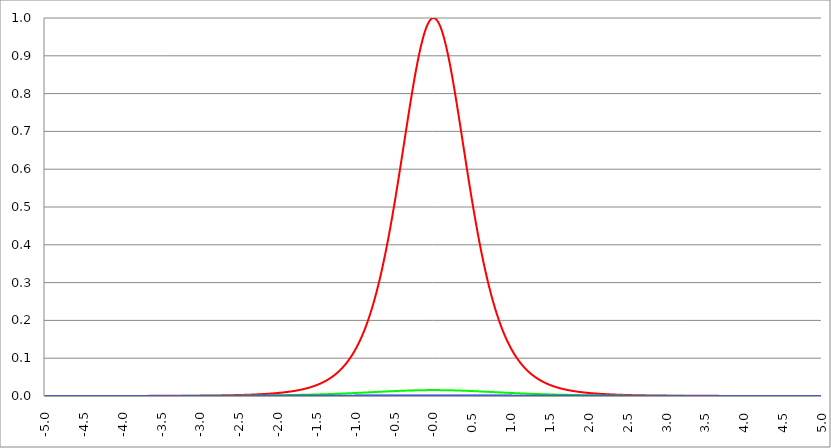
| Category | Series 1 | Series 0 | Series 2 |
|---|---|---|---|
| -5.0 | 0 | 0 | 0 |
| -4.995 | 0 | 0 | 0 |
| -4.99 | 0 | 0 | 0 |
| -4.985 | 0 | 0 | 0 |
| -4.98 | 0 | 0 | 0 |
| -4.975 | 0 | 0 | 0 |
| -4.97 | 0 | 0 | 0 |
| -4.965000000000001 | 0 | 0 | 0 |
| -4.960000000000001 | 0 | 0 | 0 |
| -4.955000000000001 | 0 | 0 | 0 |
| -4.950000000000001 | 0 | 0 | 0 |
| -4.945000000000001 | 0 | 0 | 0 |
| -4.940000000000001 | 0 | 0 | 0 |
| -4.935000000000001 | 0 | 0 | 0 |
| -4.930000000000001 | 0 | 0 | 0 |
| -4.925000000000002 | 0 | 0 | 0 |
| -4.920000000000002 | 0 | 0 | 0 |
| -4.915000000000002 | 0 | 0 | 0 |
| -4.910000000000002 | 0 | 0 | 0 |
| -4.905000000000002 | 0 | 0 | 0 |
| -4.900000000000002 | 0 | 0 | 0 |
| -4.895000000000002 | 0 | 0 | 0 |
| -4.890000000000002 | 0 | 0 | 0 |
| -4.885000000000002 | 0 | 0 | 0 |
| -4.880000000000002 | 0 | 0 | 0 |
| -4.875000000000003 | 0 | 0 | 0 |
| -4.870000000000003 | 0 | 0 | 0 |
| -4.865000000000003 | 0 | 0 | 0 |
| -4.860000000000003 | 0 | 0 | 0 |
| -4.855000000000003 | 0 | 0 | 0 |
| -4.850000000000003 | 0 | 0 | 0 |
| -4.845000000000003 | 0 | 0 | 0 |
| -4.840000000000003 | 0 | 0 | 0 |
| -4.835000000000003 | 0 | 0 | 0 |
| -4.830000000000004 | 0 | 0 | 0 |
| -4.825000000000004 | 0 | 0 | 0 |
| -4.820000000000004 | 0 | 0 | 0 |
| -4.815000000000004 | 0 | 0 | 0 |
| -4.810000000000004 | 0 | 0 | 0 |
| -4.805000000000004 | 0 | 0 | 0 |
| -4.800000000000004 | 0 | 0 | 0 |
| -4.795000000000004 | 0 | 0 | 0 |
| -4.790000000000004 | 0 | 0 | 0 |
| -4.785000000000004 | 0 | 0 | 0 |
| -4.780000000000004 | 0 | 0 | 0 |
| -4.775000000000004 | 0 | 0 | 0 |
| -4.770000000000004 | 0 | 0 | 0 |
| -4.765000000000005 | 0 | 0 | 0 |
| -4.760000000000005 | 0 | 0 | 0 |
| -4.755000000000005 | 0 | 0 | 0 |
| -4.750000000000005 | 0 | 0 | 0 |
| -4.745000000000005 | 0 | 0 | 0 |
| -4.740000000000005 | 0 | 0 | 0 |
| -4.735000000000005 | 0 | 0 | 0 |
| -4.730000000000005 | 0 | 0 | 0 |
| -4.725000000000006 | 0 | 0 | 0 |
| -4.720000000000006 | 0 | 0 | 0 |
| -4.715000000000006 | 0 | 0 | 0 |
| -4.710000000000006 | 0 | 0 | 0 |
| -4.705000000000006 | 0 | 0 | 0 |
| -4.700000000000006 | 0 | 0 | 0 |
| -4.695000000000006 | 0 | 0 | 0 |
| -4.690000000000006 | 0 | 0 | 0 |
| -4.685000000000007 | 0 | 0 | 0 |
| -4.680000000000007 | 0 | 0 | 0 |
| -4.675000000000007 | 0 | 0 | 0 |
| -4.670000000000007 | 0 | 0 | 0 |
| -4.665000000000007 | 0 | 0 | 0 |
| -4.660000000000007 | 0 | 0 | 0 |
| -4.655000000000007 | 0 | 0 | 0 |
| -4.650000000000007 | 0 | 0 | 0 |
| -4.645000000000007 | 0 | 0 | 0 |
| -4.640000000000008 | 0 | 0 | 0 |
| -4.635000000000008 | 0 | 0 | 0 |
| -4.630000000000008 | 0 | 0 | 0 |
| -4.625000000000008 | 0 | 0 | 0 |
| -4.620000000000008 | 0 | 0 | 0 |
| -4.615000000000008 | 0 | 0 | 0 |
| -4.610000000000008 | 0 | 0 | 0 |
| -4.605000000000008 | 0 | 0 | 0 |
| -4.600000000000008 | 0 | 0 | 0 |
| -4.595000000000009 | 0 | 0 | 0 |
| -4.590000000000009 | 0 | 0 | 0 |
| -4.585000000000009 | 0 | 0 | 0 |
| -4.580000000000009 | 0 | 0 | 0 |
| -4.57500000000001 | 0 | 0 | 0 |
| -4.57000000000001 | 0 | 0 | 0 |
| -4.565000000000009 | 0 | 0 | 0 |
| -4.560000000000009 | 0 | 0 | 0 |
| -4.555000000000009 | 0 | 0 | 0 |
| -4.55000000000001 | 0 | 0 | 0 |
| -4.54500000000001 | 0 | 0 | 0 |
| -4.54000000000001 | 0 | 0 | 0 |
| -4.53500000000001 | 0 | 0 | 0 |
| -4.53000000000001 | 0 | 0 | 0 |
| -4.52500000000001 | 0 | 0 | 0 |
| -4.52000000000001 | 0 | 0 | 0 |
| -4.51500000000001 | 0 | 0 | 0 |
| -4.51000000000001 | 0 | 0 | 0 |
| -4.505000000000011 | 0 | 0 | 0 |
| -4.500000000000011 | 0 | 0 | 0 |
| -4.495000000000011 | 0 | 0 | 0 |
| -4.490000000000011 | 0 | 0 | 0 |
| -4.485000000000011 | 0 | 0 | 0 |
| -4.480000000000011 | 0 | 0 | 0 |
| -4.475000000000011 | 0 | 0 | 0 |
| -4.470000000000011 | 0 | 0 | 0 |
| -4.465000000000011 | 0 | 0 | 0 |
| -4.460000000000011 | 0 | 0 | 0 |
| -4.455000000000012 | 0 | 0 | 0 |
| -4.450000000000012 | 0 | 0 | 0 |
| -4.445000000000012 | 0 | 0 | 0 |
| -4.440000000000012 | 0 | 0 | 0 |
| -4.435000000000012 | 0 | 0 | 0 |
| -4.430000000000012 | 0 | 0 | 0 |
| -4.425000000000012 | 0 | 0 | 0 |
| -4.420000000000012 | 0 | 0 | 0 |
| -4.415000000000012 | 0 | 0 | 0 |
| -4.410000000000013 | 0 | 0 | 0 |
| -4.405000000000013 | 0 | 0 | 0 |
| -4.400000000000013 | 0 | 0 | 0 |
| -4.395000000000013 | 0 | 0 | 0 |
| -4.390000000000013 | 0 | 0 | 0 |
| -4.385000000000013 | 0 | 0 | 0 |
| -4.380000000000013 | 0 | 0 | 0 |
| -4.375000000000013 | 0 | 0 | 0 |
| -4.370000000000013 | 0 | 0 | 0 |
| -4.365000000000013 | 0 | 0 | 0 |
| -4.360000000000014 | 0 | 0 | 0 |
| -4.355000000000014 | 0 | 0 | 0 |
| -4.350000000000014 | 0 | 0 | 0 |
| -4.345000000000014 | 0 | 0 | 0 |
| -4.340000000000014 | 0 | 0 | 0 |
| -4.335000000000014 | 0 | 0 | 0 |
| -4.330000000000014 | 0 | 0 | 0 |
| -4.325000000000014 | 0 | 0 | 0 |
| -4.320000000000014 | 0 | 0 | 0 |
| -4.315000000000015 | 0 | 0 | 0 |
| -4.310000000000015 | 0 | 0 | 0 |
| -4.305000000000015 | 0 | 0 | 0 |
| -4.300000000000015 | 0 | 0 | 0 |
| -4.295000000000015 | 0 | 0 | 0 |
| -4.290000000000015 | 0 | 0 | 0 |
| -4.285000000000015 | 0 | 0 | 0 |
| -4.280000000000015 | 0 | 0 | 0 |
| -4.275000000000015 | 0 | 0 | 0 |
| -4.270000000000015 | 0 | 0 | 0 |
| -4.265000000000016 | 0 | 0 | 0 |
| -4.260000000000016 | 0 | 0 | 0 |
| -4.255000000000016 | 0 | 0 | 0 |
| -4.250000000000016 | 0 | 0 | 0 |
| -4.245000000000016 | 0 | 0 | 0 |
| -4.240000000000016 | 0 | 0 | 0 |
| -4.235000000000016 | 0 | 0 | 0 |
| -4.230000000000016 | 0 | 0 | 0 |
| -4.225000000000017 | 0 | 0 | 0 |
| -4.220000000000017 | 0 | 0 | 0 |
| -4.215000000000017 | 0 | 0 | 0 |
| -4.210000000000017 | 0 | 0 | 0 |
| -4.205000000000017 | 0 | 0 | 0 |
| -4.200000000000017 | 0 | 0 | 0 |
| -4.195000000000017 | 0 | 0 | 0 |
| -4.190000000000017 | 0 | 0 | 0 |
| -4.185000000000017 | 0 | 0 | 0 |
| -4.180000000000017 | 0 | 0 | 0 |
| -4.175000000000018 | 0 | 0 | 0 |
| -4.170000000000018 | 0 | 0 | 0 |
| -4.165000000000018 | 0 | 0 | 0 |
| -4.160000000000018 | 0 | 0 | 0 |
| -4.155000000000018 | 0 | 0 | 0 |
| -4.150000000000018 | 0 | 0 | 0 |
| -4.145000000000018 | 0 | 0 | 0 |
| -4.140000000000018 | 0 | 0 | 0 |
| -4.135000000000018 | 0 | 0 | 0 |
| -4.130000000000019 | 0 | 0 | 0 |
| -4.125000000000019 | 0 | 0 | 0 |
| -4.120000000000019 | 0 | 0 | 0 |
| -4.115000000000019 | 0 | 0 | 0 |
| -4.110000000000019 | 0 | 0 | 0 |
| -4.105000000000019 | 0 | 0 | 0 |
| -4.100000000000019 | 0 | 0 | 0 |
| -4.095000000000019 | 0 | 0 | 0 |
| -4.090000000000019 | 0 | 0 | 0 |
| -4.085000000000019 | 0 | 0 | 0 |
| -4.08000000000002 | 0 | 0 | 0 |
| -4.07500000000002 | 0 | 0 | 0 |
| -4.07000000000002 | 0 | 0 | 0 |
| -4.06500000000002 | 0 | 0 | 0 |
| -4.06000000000002 | 0 | 0 | 0 |
| -4.05500000000002 | 0 | 0 | 0 |
| -4.05000000000002 | 0 | 0 | 0 |
| -4.04500000000002 | 0 | 0 | 0 |
| -4.04000000000002 | 0 | 0 | 0 |
| -4.03500000000002 | 0 | 0 | 0 |
| -4.03000000000002 | 0 | 0 | 0 |
| -4.025000000000021 | 0 | 0 | 0 |
| -4.020000000000021 | 0 | 0 | 0 |
| -4.015000000000021 | 0 | 0 | 0 |
| -4.010000000000021 | 0 | 0 | 0 |
| -4.005000000000021 | 0 | 0 | 0 |
| -4.000000000000021 | 0 | 0 | 0 |
| -3.995000000000021 | 0 | 0 | 0 |
| -3.990000000000021 | 0 | 0 | 0 |
| -3.985000000000022 | 0 | 0 | 0 |
| -3.980000000000022 | 0 | 0 | 0 |
| -3.975000000000022 | 0 | 0 | 0 |
| -3.970000000000022 | 0 | 0 | 0 |
| -3.965000000000022 | 0 | 0 | 0 |
| -3.960000000000022 | 0 | 0 | 0 |
| -3.955000000000022 | 0 | 0 | 0 |
| -3.950000000000022 | 0 | 0 | 0 |
| -3.945000000000022 | 0 | 0 | 0 |
| -3.940000000000023 | 0 | 0 | 0 |
| -3.935000000000023 | 0 | 0 | 0 |
| -3.930000000000023 | 0 | 0 | 0 |
| -3.925000000000023 | 0 | 0 | 0 |
| -3.920000000000023 | 0 | 0 | 0 |
| -3.915000000000023 | 0 | 0 | 0 |
| -3.910000000000023 | 0 | 0 | 0 |
| -3.905000000000023 | 0 | 0 | 0 |
| -3.900000000000023 | 0 | 0 | 0 |
| -3.895000000000023 | 0 | 0 | 0 |
| -3.890000000000024 | 0 | 0 | 0 |
| -3.885000000000024 | 0 | 0 | 0 |
| -3.880000000000024 | 0 | 0 | 0 |
| -3.875000000000024 | 0 | 0 | 0 |
| -3.870000000000024 | 0 | 0 | 0 |
| -3.865000000000024 | 0 | 0 | 0 |
| -3.860000000000024 | 0 | 0 | 0 |
| -3.855000000000024 | 0 | 0 | 0 |
| -3.850000000000024 | 0 | 0 | 0 |
| -3.845000000000025 | 0 | 0 | 0 |
| -3.840000000000025 | 0 | 0 | 0 |
| -3.835000000000025 | 0 | 0 | 0 |
| -3.830000000000025 | 0 | 0 | 0 |
| -3.825000000000025 | 0 | 0 | 0 |
| -3.820000000000025 | 0 | 0 | 0 |
| -3.815000000000025 | 0 | 0 | 0 |
| -3.810000000000025 | 0 | 0 | 0 |
| -3.805000000000025 | 0 | 0 | 0 |
| -3.800000000000026 | 0 | 0 | 0 |
| -3.795000000000026 | 0 | 0 | 0 |
| -3.790000000000026 | 0 | 0 | 0 |
| -3.785000000000026 | 0 | 0 | 0 |
| -3.780000000000026 | 0 | 0 | 0 |
| -3.775000000000026 | 0 | 0 | 0 |
| -3.770000000000026 | 0 | 0 | 0 |
| -3.765000000000026 | 0 | 0 | 0 |
| -3.760000000000026 | 0 | 0 | 0 |
| -3.755000000000026 | 0 | 0 | 0 |
| -3.750000000000027 | 0 | 0 | 0 |
| -3.745000000000027 | 0 | 0 | 0 |
| -3.740000000000027 | 0 | 0 | 0 |
| -3.735000000000027 | 0 | 0 | 0 |
| -3.730000000000027 | 0 | 0 | 0 |
| -3.725000000000027 | 0 | 0 | 0 |
| -3.720000000000027 | 0 | 0 | 0 |
| -3.715000000000027 | 0 | 0 | 0 |
| -3.710000000000027 | 0 | 0 | 0 |
| -3.705000000000028 | 0 | 0 | 0 |
| -3.700000000000028 | 0 | 0 | 0 |
| -3.695000000000028 | 0 | 0 | 0 |
| -3.690000000000028 | 0 | 0 | 0 |
| -3.685000000000028 | 0 | 0 | 0 |
| -3.680000000000028 | 0 | 0 | 0 |
| -3.675000000000028 | 0 | 0 | 0 |
| -3.670000000000028 | 0 | 0 | 0 |
| -3.665000000000028 | 0 | 0 | 0 |
| -3.660000000000028 | 0 | 0 | 0 |
| -3.655000000000029 | 0 | 0 | 0 |
| -3.650000000000029 | 0 | 0 | 0 |
| -3.645000000000029 | 0 | 0 | 0 |
| -3.640000000000029 | 0 | 0 | 0 |
| -3.635000000000029 | 0 | 0 | 0 |
| -3.630000000000029 | 0 | 0 | 0 |
| -3.625000000000029 | 0 | 0 | 0 |
| -3.620000000000029 | 0 | 0 | 0 |
| -3.615000000000029 | 0 | 0 | 0 |
| -3.61000000000003 | 0 | 0 | 0 |
| -3.60500000000003 | 0 | 0 | 0 |
| -3.60000000000003 | 0 | 0 | 0 |
| -3.59500000000003 | 0 | 0 | 0 |
| -3.59000000000003 | 0 | 0 | 0 |
| -3.58500000000003 | 0 | 0 | 0 |
| -3.58000000000003 | 0 | 0 | 0 |
| -3.57500000000003 | 0 | 0 | 0 |
| -3.57000000000003 | 0 | 0 | 0 |
| -3.565000000000031 | 0 | 0 | 0 |
| -3.560000000000031 | 0 | 0 | 0 |
| -3.555000000000031 | 0 | 0 | 0 |
| -3.550000000000031 | 0 | 0 | 0 |
| -3.545000000000031 | 0 | 0 | 0 |
| -3.540000000000031 | 0 | 0 | 0 |
| -3.535000000000031 | 0 | 0 | 0 |
| -3.530000000000031 | 0 | 0 | 0 |
| -3.525000000000031 | 0 | 0 | 0 |
| -3.520000000000032 | 0 | 0 | 0 |
| -3.515000000000032 | 0 | 0 | 0 |
| -3.510000000000032 | 0 | 0 | 0 |
| -3.505000000000032 | 0 | 0 | 0 |
| -3.500000000000032 | 0 | 0 | 0 |
| -3.495000000000032 | 0 | 0 | 0 |
| -3.490000000000032 | 0 | 0 | 0 |
| -3.485000000000032 | 0 | 0 | 0 |
| -3.480000000000032 | 0 | 0 | 0 |
| -3.475000000000032 | 0 | 0 | 0 |
| -3.470000000000033 | 0 | 0 | 0 |
| -3.465000000000033 | 0 | 0 | 0 |
| -3.460000000000033 | 0 | 0 | 0 |
| -3.455000000000033 | 0 | 0 | 0 |
| -3.450000000000033 | 0 | 0 | 0 |
| -3.445000000000033 | 0 | 0 | 0 |
| -3.440000000000033 | 0 | 0 | 0 |
| -3.435000000000033 | 0 | 0 | 0 |
| -3.430000000000033 | 0 | 0 | 0 |
| -3.425000000000034 | 0 | 0 | 0 |
| -3.420000000000034 | 0 | 0 | 0 |
| -3.415000000000034 | 0 | 0 | 0 |
| -3.410000000000034 | 0 | 0 | 0 |
| -3.405000000000034 | 0.001 | 0 | 0 |
| -3.400000000000034 | 0.001 | 0 | 0 |
| -3.395000000000034 | 0.001 | 0 | 0 |
| -3.390000000000034 | 0.001 | 0 | 0 |
| -3.385000000000034 | 0.001 | 0 | 0 |
| -3.380000000000034 | 0.001 | 0 | 0 |
| -3.375000000000035 | 0.001 | 0 | 0 |
| -3.370000000000035 | 0.001 | 0 | 0 |
| -3.365000000000035 | 0.001 | 0 | 0 |
| -3.360000000000035 | 0.001 | 0 | 0 |
| -3.355000000000035 | 0.001 | 0 | 0 |
| -3.350000000000035 | 0.001 | 0 | 0 |
| -3.345000000000035 | 0.001 | 0 | 0 |
| -3.340000000000035 | 0.001 | 0 | 0 |
| -3.335000000000035 | 0.001 | 0 | 0 |
| -3.330000000000036 | 0.001 | 0 | 0 |
| -3.325000000000036 | 0.001 | 0 | 0 |
| -3.320000000000036 | 0.001 | 0 | 0 |
| -3.315000000000036 | 0.001 | 0 | 0 |
| -3.310000000000036 | 0.001 | 0 | 0 |
| -3.305000000000036 | 0.001 | 0 | 0 |
| -3.300000000000036 | 0.001 | 0 | 0 |
| -3.295000000000036 | 0.001 | 0 | 0 |
| -3.290000000000036 | 0.001 | 0 | 0 |
| -3.285000000000036 | 0.001 | 0 | 0 |
| -3.280000000000036 | 0.001 | 0 | 0 |
| -3.275000000000037 | 0.001 | 0 | 0 |
| -3.270000000000037 | 0.001 | 0 | 0 |
| -3.265000000000037 | 0.001 | 0 | 0 |
| -3.260000000000037 | 0.001 | 0 | 0 |
| -3.255000000000037 | 0.001 | 0 | 0 |
| -3.250000000000037 | 0.001 | 0 | 0 |
| -3.245000000000037 | 0.001 | 0 | 0 |
| -3.240000000000037 | 0.001 | 0 | 0 |
| -3.235000000000038 | 0.001 | 0 | 0 |
| -3.230000000000038 | 0.001 | 0 | 0 |
| -3.225000000000038 | 0.001 | 0 | 0 |
| -3.220000000000038 | 0.001 | 0 | 0 |
| -3.215000000000038 | 0.001 | 0 | 0 |
| -3.210000000000038 | 0.001 | 0 | 0 |
| -3.205000000000038 | 0.001 | 0 | 0 |
| -3.200000000000038 | 0.001 | 0 | 0 |
| -3.195000000000038 | 0.001 | 0 | 0 |
| -3.190000000000039 | 0.001 | 0 | 0 |
| -3.185000000000039 | 0.001 | 0 | 0 |
| -3.180000000000039 | 0.001 | 0 | 0 |
| -3.175000000000039 | 0.001 | 0 | 0 |
| -3.170000000000039 | 0.001 | 0 | 0 |
| -3.16500000000004 | 0.001 | 0 | 0 |
| -3.16000000000004 | 0.001 | 0 | 0 |
| -3.155000000000039 | 0.001 | 0 | 0 |
| -3.150000000000039 | 0.001 | 0 | 0 |
| -3.14500000000004 | 0.001 | 0 | 0 |
| -3.14000000000004 | 0.001 | 0 | 0 |
| -3.13500000000004 | 0.001 | 0 | 0 |
| -3.13000000000004 | 0.001 | 0 | 0 |
| -3.12500000000004 | 0.001 | 0 | 0 |
| -3.12000000000004 | 0.001 | 0 | 0 |
| -3.11500000000004 | 0.001 | 0 | 0 |
| -3.11000000000004 | 0.001 | 0 | 0 |
| -3.10500000000004 | 0.001 | 0 | 0 |
| -3.10000000000004 | 0.001 | 0 | 0 |
| -3.095000000000041 | 0.001 | 0 | 0 |
| -3.090000000000041 | 0.001 | 0 | 0 |
| -3.085000000000041 | 0.001 | 0 | 0 |
| -3.080000000000041 | 0.001 | 0 | 0 |
| -3.075000000000041 | 0.001 | 0 | 0 |
| -3.070000000000041 | 0.001 | 0 | 0 |
| -3.065000000000041 | 0.001 | 0 | 0 |
| -3.060000000000041 | 0.001 | 0 | 0 |
| -3.055000000000041 | 0.001 | 0 | 0 |
| -3.050000000000042 | 0.001 | 0 | 0 |
| -3.045000000000042 | 0.001 | 0 | 0 |
| -3.040000000000042 | 0.001 | 0 | 0 |
| -3.035000000000042 | 0.001 | 0 | 0 |
| -3.030000000000042 | 0.001 | 0 | 0 |
| -3.025000000000042 | 0.001 | 0 | 0 |
| -3.020000000000042 | 0.001 | 0 | 0 |
| -3.015000000000042 | 0.001 | 0 | 0 |
| -3.010000000000042 | 0.001 | 0 | 0 |
| -3.005000000000043 | 0.001 | 0 | 0 |
| -3.000000000000043 | 0.001 | 0 | 0 |
| -2.995000000000043 | 0.001 | 0 | 0 |
| -2.990000000000043 | 0.001 | 0 | 0 |
| -2.985000000000043 | 0.001 | 0 | 0 |
| -2.980000000000043 | 0.001 | 0 | 0 |
| -2.975000000000043 | 0.001 | 0 | 0 |
| -2.970000000000043 | 0.001 | 0 | 0 |
| -2.965000000000043 | 0.001 | 0 | 0 |
| -2.960000000000043 | 0.001 | 0 | 0 |
| -2.955000000000044 | 0.001 | 0 | 0 |
| -2.950000000000044 | 0.001 | 0 | 0 |
| -2.945000000000044 | 0.001 | 0 | 0 |
| -2.940000000000044 | 0.001 | 0 | 0 |
| -2.935000000000044 | 0.001 | 0 | 0 |
| -2.930000000000044 | 0.001 | 0.001 | 0 |
| -2.925000000000044 | 0.001 | 0.001 | 0 |
| -2.920000000000044 | 0.001 | 0.001 | 0 |
| -2.915000000000044 | 0.001 | 0.001 | 0 |
| -2.910000000000045 | 0.001 | 0.001 | 0 |
| -2.905000000000045 | 0.001 | 0.001 | 0 |
| -2.900000000000045 | 0.001 | 0.001 | 0 |
| -2.895000000000045 | 0.001 | 0.001 | 0 |
| -2.890000000000045 | 0.001 | 0.001 | 0 |
| -2.885000000000045 | 0.001 | 0.001 | 0 |
| -2.880000000000045 | 0.001 | 0.001 | 0 |
| -2.875000000000045 | 0.001 | 0.001 | 0 |
| -2.870000000000045 | 0.001 | 0.001 | 0 |
| -2.865000000000045 | 0.001 | 0.001 | 0 |
| -2.860000000000046 | 0.001 | 0.001 | 0 |
| -2.855000000000046 | 0.001 | 0.001 | 0 |
| -2.850000000000046 | 0.001 | 0.001 | 0 |
| -2.845000000000046 | 0.001 | 0.001 | 0 |
| -2.840000000000046 | 0.001 | 0.001 | 0 |
| -2.835000000000046 | 0.001 | 0.001 | 0 |
| -2.830000000000046 | 0.001 | 0.001 | 0 |
| -2.825000000000046 | 0.001 | 0.001 | 0 |
| -2.820000000000046 | 0.001 | 0.001 | 0 |
| -2.815000000000047 | 0.001 | 0.001 | 0 |
| -2.810000000000047 | 0.001 | 0.001 | 0 |
| -2.805000000000047 | 0.001 | 0.001 | 0 |
| -2.800000000000047 | 0.001 | 0.001 | 0 |
| -2.795000000000047 | 0.001 | 0.001 | 0 |
| -2.790000000000047 | 0.001 | 0.001 | 0 |
| -2.785000000000047 | 0.001 | 0.001 | 0 |
| -2.780000000000047 | 0.002 | 0.001 | 0 |
| -2.775000000000047 | 0.002 | 0.001 | 0 |
| -2.770000000000047 | 0.002 | 0.001 | 0 |
| -2.765000000000048 | 0.002 | 0.001 | 0 |
| -2.760000000000048 | 0.002 | 0.001 | 0 |
| -2.755000000000048 | 0.002 | 0.001 | 0 |
| -2.750000000000048 | 0.002 | 0.001 | 0 |
| -2.745000000000048 | 0.002 | 0.001 | 0 |
| -2.740000000000048 | 0.002 | 0.001 | 0 |
| -2.735000000000048 | 0.002 | 0.001 | 0 |
| -2.730000000000048 | 0.002 | 0.001 | 0 |
| -2.725000000000048 | 0.002 | 0.001 | 0 |
| -2.720000000000049 | 0.002 | 0.001 | 0 |
| -2.715000000000049 | 0.002 | 0.001 | 0 |
| -2.710000000000049 | 0.002 | 0.001 | 0 |
| -2.705000000000049 | 0.002 | 0.001 | 0 |
| -2.700000000000049 | 0.002 | 0.001 | 0 |
| -2.695000000000049 | 0.002 | 0.001 | 0 |
| -2.690000000000049 | 0.002 | 0.001 | 0 |
| -2.685000000000049 | 0.002 | 0.001 | 0 |
| -2.680000000000049 | 0.002 | 0.001 | 0 |
| -2.675000000000049 | 0.002 | 0.001 | 0 |
| -2.67000000000005 | 0.002 | 0.001 | 0 |
| -2.66500000000005 | 0.002 | 0.001 | 0 |
| -2.66000000000005 | 0.002 | 0.001 | 0 |
| -2.65500000000005 | 0.002 | 0.001 | 0 |
| -2.65000000000005 | 0.002 | 0.001 | 0 |
| -2.64500000000005 | 0.002 | 0.001 | 0 |
| -2.64000000000005 | 0.002 | 0.001 | 0 |
| -2.63500000000005 | 0.002 | 0.001 | 0 |
| -2.63000000000005 | 0.002 | 0.001 | 0 |
| -2.625000000000051 | 0.002 | 0.001 | 0 |
| -2.620000000000051 | 0.002 | 0.001 | 0 |
| -2.615000000000051 | 0.002 | 0.001 | 0 |
| -2.610000000000051 | 0.002 | 0.001 | 0 |
| -2.605000000000051 | 0.002 | 0.001 | 0 |
| -2.600000000000051 | 0.002 | 0.001 | 0 |
| -2.595000000000051 | 0.002 | 0.001 | 0 |
| -2.590000000000051 | 0.002 | 0.001 | 0 |
| -2.585000000000051 | 0.002 | 0.001 | 0 |
| -2.580000000000052 | 0.002 | 0.001 | 0 |
| -2.575000000000052 | 0.002 | 0.001 | 0 |
| -2.570000000000052 | 0.002 | 0.001 | 0 |
| -2.565000000000052 | 0.002 | 0.001 | 0 |
| -2.560000000000052 | 0.002 | 0.001 | 0 |
| -2.555000000000052 | 0.002 | 0.001 | 0 |
| -2.550000000000052 | 0.002 | 0.001 | 0 |
| -2.545000000000052 | 0.002 | 0.001 | 0 |
| -2.540000000000052 | 0.002 | 0.001 | 0 |
| -2.535000000000053 | 0.002 | 0.001 | 0 |
| -2.530000000000053 | 0.002 | 0.001 | 0 |
| -2.525000000000053 | 0.002 | 0.001 | 0 |
| -2.520000000000053 | 0.003 | 0.001 | 0 |
| -2.515000000000053 | 0.003 | 0.001 | 0 |
| -2.510000000000053 | 0.003 | 0.001 | 0 |
| -2.505000000000053 | 0.003 | 0.001 | 0 |
| -2.500000000000053 | 0.003 | 0.001 | 0 |
| -2.495000000000053 | 0.003 | 0.001 | 0 |
| -2.490000000000053 | 0.003 | 0.001 | 0 |
| -2.485000000000054 | 0.003 | 0.001 | 0 |
| -2.480000000000054 | 0.003 | 0.001 | 0 |
| -2.475000000000054 | 0.003 | 0.001 | 0 |
| -2.470000000000054 | 0.003 | 0.001 | 0 |
| -2.465000000000054 | 0.003 | 0.001 | 0 |
| -2.460000000000054 | 0.003 | 0.001 | 0 |
| -2.455000000000054 | 0.003 | 0.001 | 0 |
| -2.450000000000054 | 0.003 | 0.001 | 0 |
| -2.445000000000054 | 0.003 | 0.001 | 0 |
| -2.440000000000055 | 0.003 | 0.001 | 0 |
| -2.435000000000055 | 0.003 | 0.001 | 0 |
| -2.430000000000055 | 0.003 | 0.001 | 0 |
| -2.425000000000055 | 0.003 | 0.001 | 0 |
| -2.420000000000055 | 0.003 | 0.001 | 0 |
| -2.415000000000055 | 0.003 | 0.001 | 0 |
| -2.410000000000055 | 0.003 | 0.001 | 0 |
| -2.405000000000055 | 0.003 | 0.001 | 0 |
| -2.400000000000055 | 0.003 | 0.001 | 0 |
| -2.395000000000055 | 0.003 | 0.001 | 0 |
| -2.390000000000056 | 0.003 | 0.001 | 0 |
| -2.385000000000056 | 0.003 | 0.001 | 0 |
| -2.380000000000056 | 0.003 | 0.001 | 0 |
| -2.375000000000056 | 0.003 | 0.001 | 0 |
| -2.370000000000056 | 0.003 | 0.001 | 0 |
| -2.365000000000056 | 0.003 | 0.001 | 0 |
| -2.360000000000056 | 0.004 | 0.001 | 0 |
| -2.355000000000056 | 0.004 | 0.001 | 0 |
| -2.350000000000056 | 0.004 | 0.001 | 0 |
| -2.345000000000057 | 0.004 | 0.001 | 0 |
| -2.340000000000057 | 0.004 | 0.001 | 0 |
| -2.335000000000057 | 0.004 | 0.001 | 0 |
| -2.330000000000057 | 0.004 | 0.001 | 0 |
| -2.325000000000057 | 0.004 | 0.001 | 0 |
| -2.320000000000057 | 0.004 | 0.001 | 0 |
| -2.315000000000057 | 0.004 | 0.001 | 0 |
| -2.310000000000057 | 0.004 | 0.001 | 0 |
| -2.305000000000057 | 0.004 | 0.001 | 0 |
| -2.300000000000058 | 0.004 | 0.001 | 0 |
| -2.295000000000058 | 0.004 | 0.001 | 0 |
| -2.290000000000058 | 0.004 | 0.001 | 0 |
| -2.285000000000058 | 0.004 | 0.001 | 0 |
| -2.280000000000058 | 0.004 | 0.001 | 0 |
| -2.275000000000058 | 0.004 | 0.001 | 0 |
| -2.270000000000058 | 0.004 | 0.001 | 0 |
| -2.265000000000058 | 0.004 | 0.001 | 0 |
| -2.260000000000058 | 0.004 | 0.001 | 0 |
| -2.255000000000058 | 0.004 | 0.001 | 0 |
| -2.250000000000059 | 0.004 | 0.001 | 0 |
| -2.245000000000059 | 0.005 | 0.001 | 0 |
| -2.240000000000059 | 0.005 | 0.001 | 0 |
| -2.235000000000059 | 0.005 | 0.001 | 0 |
| -2.23000000000006 | 0.005 | 0.001 | 0 |
| -2.22500000000006 | 0.005 | 0.001 | 0 |
| -2.22000000000006 | 0.005 | 0.001 | 0 |
| -2.215000000000059 | 0.005 | 0.001 | 0 |
| -2.210000000000059 | 0.005 | 0.001 | 0 |
| -2.20500000000006 | 0.005 | 0.001 | 0 |
| -2.20000000000006 | 0.005 | 0.001 | 0 |
| -2.19500000000006 | 0.005 | 0.001 | 0 |
| -2.19000000000006 | 0.005 | 0.001 | 0 |
| -2.18500000000006 | 0.005 | 0.001 | 0 |
| -2.18000000000006 | 0.005 | 0.001 | 0 |
| -2.17500000000006 | 0.005 | 0.002 | 0 |
| -2.17000000000006 | 0.005 | 0.002 | 0 |
| -2.16500000000006 | 0.005 | 0.002 | 0 |
| -2.160000000000061 | 0.005 | 0.002 | 0 |
| -2.155000000000061 | 0.006 | 0.002 | 0 |
| -2.150000000000061 | 0.006 | 0.002 | 0 |
| -2.145000000000061 | 0.006 | 0.002 | 0 |
| -2.140000000000061 | 0.006 | 0.002 | 0 |
| -2.135000000000061 | 0.006 | 0.002 | 0 |
| -2.130000000000061 | 0.006 | 0.002 | 0 |
| -2.125000000000061 | 0.006 | 0.002 | 0 |
| -2.120000000000061 | 0.006 | 0.002 | 0 |
| -2.115000000000061 | 0.006 | 0.002 | 0 |
| -2.110000000000062 | 0.006 | 0.002 | 0 |
| -2.105000000000062 | 0.006 | 0.002 | 0 |
| -2.100000000000062 | 0.006 | 0.002 | 0 |
| -2.095000000000062 | 0.006 | 0.002 | 0 |
| -2.090000000000062 | 0.006 | 0.002 | 0 |
| -2.085000000000062 | 0.007 | 0.002 | 0 |
| -2.080000000000062 | 0.007 | 0.002 | 0 |
| -2.075000000000062 | 0.007 | 0.002 | 0 |
| -2.070000000000062 | 0.007 | 0.002 | 0 |
| -2.065000000000063 | 0.007 | 0.002 | 0 |
| -2.060000000000063 | 0.007 | 0.002 | 0 |
| -2.055000000000063 | 0.007 | 0.002 | 0 |
| -2.050000000000063 | 0.007 | 0.002 | 0 |
| -2.045000000000063 | 0.007 | 0.002 | 0 |
| -2.040000000000063 | 0.007 | 0.002 | 0 |
| -2.035000000000063 | 0.007 | 0.002 | 0 |
| -2.030000000000063 | 0.007 | 0.002 | 0 |
| -2.025000000000063 | 0.008 | 0.002 | 0 |
| -2.020000000000064 | 0.008 | 0.002 | 0 |
| -2.015000000000064 | 0.008 | 0.002 | 0 |
| -2.010000000000064 | 0.008 | 0.002 | 0 |
| -2.005000000000064 | 0.008 | 0.002 | 0 |
| -2.000000000000064 | 0.008 | 0.002 | 0 |
| -1.995000000000064 | 0.008 | 0.002 | 0 |
| -1.990000000000064 | 0.008 | 0.002 | 0 |
| -1.985000000000064 | 0.008 | 0.002 | 0 |
| -1.980000000000064 | 0.008 | 0.002 | 0 |
| -1.975000000000064 | 0.008 | 0.002 | 0 |
| -1.970000000000065 | 0.009 | 0.002 | 0 |
| -1.965000000000065 | 0.009 | 0.002 | 0 |
| -1.960000000000065 | 0.009 | 0.002 | 0 |
| -1.955000000000065 | 0.009 | 0.002 | 0 |
| -1.950000000000065 | 0.009 | 0.002 | 0 |
| -1.945000000000065 | 0.009 | 0.002 | 0 |
| -1.940000000000065 | 0.009 | 0.002 | 0 |
| -1.935000000000065 | 0.009 | 0.002 | 0 |
| -1.930000000000065 | 0.009 | 0.002 | 0 |
| -1.925000000000066 | 0.01 | 0.002 | 0 |
| -1.920000000000066 | 0.01 | 0.002 | 0 |
| -1.915000000000066 | 0.01 | 0.002 | 0 |
| -1.910000000000066 | 0.01 | 0.002 | 0 |
| -1.905000000000066 | 0.01 | 0.002 | 0 |
| -1.900000000000066 | 0.01 | 0.002 | 0 |
| -1.895000000000066 | 0.01 | 0.002 | 0.001 |
| -1.890000000000066 | 0.01 | 0.002 | 0.001 |
| -1.885000000000066 | 0.011 | 0.002 | 0.001 |
| -1.880000000000066 | 0.011 | 0.002 | 0.001 |
| -1.875000000000067 | 0.011 | 0.002 | 0.001 |
| -1.870000000000067 | 0.011 | 0.002 | 0.001 |
| -1.865000000000067 | 0.011 | 0.002 | 0.001 |
| -1.860000000000067 | 0.011 | 0.002 | 0.001 |
| -1.855000000000067 | 0.011 | 0.002 | 0.001 |
| -1.850000000000067 | 0.012 | 0.002 | 0.001 |
| -1.845000000000067 | 0.012 | 0.002 | 0.001 |
| -1.840000000000067 | 0.012 | 0.002 | 0.001 |
| -1.835000000000067 | 0.012 | 0.003 | 0.001 |
| -1.830000000000068 | 0.012 | 0.003 | 0.001 |
| -1.825000000000068 | 0.012 | 0.003 | 0.001 |
| -1.820000000000068 | 0.012 | 0.003 | 0.001 |
| -1.815000000000068 | 0.013 | 0.003 | 0.001 |
| -1.810000000000068 | 0.013 | 0.003 | 0.001 |
| -1.805000000000068 | 0.013 | 0.003 | 0.001 |
| -1.800000000000068 | 0.013 | 0.003 | 0.001 |
| -1.795000000000068 | 0.013 | 0.003 | 0.001 |
| -1.790000000000068 | 0.013 | 0.003 | 0.001 |
| -1.785000000000068 | 0.014 | 0.003 | 0.001 |
| -1.780000000000069 | 0.014 | 0.003 | 0.001 |
| -1.775000000000069 | 0.014 | 0.003 | 0.001 |
| -1.770000000000069 | 0.014 | 0.003 | 0.001 |
| -1.765000000000069 | 0.014 | 0.003 | 0.001 |
| -1.760000000000069 | 0.015 | 0.003 | 0.001 |
| -1.75500000000007 | 0.015 | 0.003 | 0.001 |
| -1.75000000000007 | 0.015 | 0.003 | 0.001 |
| -1.745000000000069 | 0.015 | 0.003 | 0.001 |
| -1.740000000000069 | 0.015 | 0.003 | 0.001 |
| -1.73500000000007 | 0.016 | 0.003 | 0.001 |
| -1.73000000000007 | 0.016 | 0.003 | 0.001 |
| -1.72500000000007 | 0.016 | 0.003 | 0.001 |
| -1.72000000000007 | 0.016 | 0.003 | 0.001 |
| -1.71500000000007 | 0.016 | 0.003 | 0.001 |
| -1.71000000000007 | 0.017 | 0.003 | 0.001 |
| -1.70500000000007 | 0.017 | 0.003 | 0.001 |
| -1.70000000000007 | 0.017 | 0.003 | 0.001 |
| -1.69500000000007 | 0.017 | 0.003 | 0.001 |
| -1.69000000000007 | 0.017 | 0.003 | 0.001 |
| -1.685000000000071 | 0.018 | 0.003 | 0.001 |
| -1.680000000000071 | 0.018 | 0.003 | 0.001 |
| -1.675000000000071 | 0.018 | 0.003 | 0.001 |
| -1.670000000000071 | 0.018 | 0.003 | 0.001 |
| -1.665000000000071 | 0.019 | 0.003 | 0.001 |
| -1.660000000000071 | 0.019 | 0.003 | 0.001 |
| -1.655000000000071 | 0.019 | 0.003 | 0.001 |
| -1.650000000000071 | 0.019 | 0.003 | 0.001 |
| -1.645000000000071 | 0.02 | 0.003 | 0.001 |
| -1.640000000000072 | 0.02 | 0.003 | 0.001 |
| -1.635000000000072 | 0.02 | 0.003 | 0.001 |
| -1.630000000000072 | 0.02 | 0.003 | 0.001 |
| -1.625000000000072 | 0.021 | 0.003 | 0.001 |
| -1.620000000000072 | 0.021 | 0.003 | 0.001 |
| -1.615000000000072 | 0.021 | 0.003 | 0.001 |
| -1.610000000000072 | 0.022 | 0.003 | 0.001 |
| -1.605000000000072 | 0.022 | 0.004 | 0.001 |
| -1.600000000000072 | 0.022 | 0.004 | 0.001 |
| -1.595000000000073 | 0.022 | 0.004 | 0.001 |
| -1.590000000000073 | 0.023 | 0.004 | 0.001 |
| -1.585000000000073 | 0.023 | 0.004 | 0.001 |
| -1.580000000000073 | 0.023 | 0.004 | 0.001 |
| -1.575000000000073 | 0.024 | 0.004 | 0.001 |
| -1.570000000000073 | 0.024 | 0.004 | 0.001 |
| -1.565000000000073 | 0.024 | 0.004 | 0.001 |
| -1.560000000000073 | 0.025 | 0.004 | 0.001 |
| -1.555000000000073 | 0.025 | 0.004 | 0.001 |
| -1.550000000000074 | 0.025 | 0.004 | 0.001 |
| -1.545000000000074 | 0.026 | 0.004 | 0.001 |
| -1.540000000000074 | 0.026 | 0.004 | 0.001 |
| -1.535000000000074 | 0.026 | 0.004 | 0.001 |
| -1.530000000000074 | 0.027 | 0.004 | 0.001 |
| -1.525000000000074 | 0.027 | 0.004 | 0.001 |
| -1.520000000000074 | 0.028 | 0.004 | 0.001 |
| -1.515000000000074 | 0.028 | 0.004 | 0.001 |
| -1.510000000000074 | 0.028 | 0.004 | 0.001 |
| -1.505000000000074 | 0.029 | 0.004 | 0.001 |
| -1.500000000000075 | 0.029 | 0.004 | 0.001 |
| -1.495000000000075 | 0.03 | 0.004 | 0.001 |
| -1.490000000000075 | 0.03 | 0.004 | 0.001 |
| -1.485000000000075 | 0.03 | 0.004 | 0.001 |
| -1.480000000000075 | 0.031 | 0.004 | 0.001 |
| -1.475000000000075 | 0.031 | 0.004 | 0.001 |
| -1.470000000000075 | 0.032 | 0.004 | 0.001 |
| -1.465000000000075 | 0.032 | 0.004 | 0.001 |
| -1.460000000000075 | 0.033 | 0.004 | 0.001 |
| -1.455000000000076 | 0.033 | 0.004 | 0.001 |
| -1.450000000000076 | 0.033 | 0.004 | 0.001 |
| -1.445000000000076 | 0.034 | 0.004 | 0.001 |
| -1.440000000000076 | 0.034 | 0.004 | 0.001 |
| -1.435000000000076 | 0.035 | 0.004 | 0.001 |
| -1.430000000000076 | 0.035 | 0.005 | 0.001 |
| -1.425000000000076 | 0.036 | 0.005 | 0.001 |
| -1.420000000000076 | 0.036 | 0.005 | 0.001 |
| -1.415000000000076 | 0.037 | 0.005 | 0.001 |
| -1.410000000000077 | 0.037 | 0.005 | 0.001 |
| -1.405000000000077 | 0.038 | 0.005 | 0.001 |
| -1.400000000000077 | 0.039 | 0.005 | 0.001 |
| -1.395000000000077 | 0.039 | 0.005 | 0.001 |
| -1.390000000000077 | 0.04 | 0.005 | 0.001 |
| -1.385000000000077 | 0.04 | 0.005 | 0.001 |
| -1.380000000000077 | 0.041 | 0.005 | 0.001 |
| -1.375000000000077 | 0.041 | 0.005 | 0.001 |
| -1.370000000000077 | 0.042 | 0.005 | 0.001 |
| -1.365000000000077 | 0.043 | 0.005 | 0.001 |
| -1.360000000000078 | 0.043 | 0.005 | 0.001 |
| -1.355000000000078 | 0.044 | 0.005 | 0.001 |
| -1.350000000000078 | 0.044 | 0.005 | 0.001 |
| -1.345000000000078 | 0.045 | 0.005 | 0.001 |
| -1.340000000000078 | 0.046 | 0.005 | 0.001 |
| -1.335000000000078 | 0.046 | 0.005 | 0.001 |
| -1.330000000000078 | 0.047 | 0.005 | 0.001 |
| -1.325000000000078 | 0.048 | 0.005 | 0.001 |
| -1.320000000000078 | 0.048 | 0.005 | 0.001 |
| -1.315000000000079 | 0.049 | 0.005 | 0.001 |
| -1.310000000000079 | 0.05 | 0.005 | 0.001 |
| -1.305000000000079 | 0.051 | 0.005 | 0.001 |
| -1.300000000000079 | 0.051 | 0.005 | 0.001 |
| -1.295000000000079 | 0.052 | 0.005 | 0.001 |
| -1.29000000000008 | 0.053 | 0.006 | 0.001 |
| -1.285000000000079 | 0.054 | 0.006 | 0.001 |
| -1.280000000000079 | 0.054 | 0.006 | 0.001 |
| -1.275000000000079 | 0.055 | 0.006 | 0.001 |
| -1.270000000000079 | 0.056 | 0.006 | 0.001 |
| -1.26500000000008 | 0.057 | 0.006 | 0.001 |
| -1.26000000000008 | 0.058 | 0.006 | 0.001 |
| -1.25500000000008 | 0.059 | 0.006 | 0.001 |
| -1.25000000000008 | 0.059 | 0.006 | 0.001 |
| -1.24500000000008 | 0.06 | 0.006 | 0.001 |
| -1.24000000000008 | 0.061 | 0.006 | 0.001 |
| -1.23500000000008 | 0.062 | 0.006 | 0.001 |
| -1.23000000000008 | 0.063 | 0.006 | 0.001 |
| -1.22500000000008 | 0.064 | 0.006 | 0.001 |
| -1.220000000000081 | 0.065 | 0.006 | 0.001 |
| -1.215000000000081 | 0.066 | 0.006 | 0.001 |
| -1.210000000000081 | 0.067 | 0.006 | 0.001 |
| -1.205000000000081 | 0.068 | 0.006 | 0.001 |
| -1.200000000000081 | 0.069 | 0.006 | 0.001 |
| -1.195000000000081 | 0.07 | 0.006 | 0.001 |
| -1.190000000000081 | 0.071 | 0.006 | 0.001 |
| -1.185000000000081 | 0.072 | 0.006 | 0.001 |
| -1.180000000000081 | 0.073 | 0.006 | 0.001 |
| -1.175000000000082 | 0.074 | 0.006 | 0.001 |
| -1.170000000000082 | 0.075 | 0.006 | 0.001 |
| -1.165000000000082 | 0.076 | 0.007 | 0.001 |
| -1.160000000000082 | 0.077 | 0.007 | 0.001 |
| -1.155000000000082 | 0.079 | 0.007 | 0.001 |
| -1.150000000000082 | 0.08 | 0.007 | 0.001 |
| -1.145000000000082 | 0.081 | 0.007 | 0.001 |
| -1.140000000000082 | 0.082 | 0.007 | 0.001 |
| -1.135000000000082 | 0.083 | 0.007 | 0.001 |
| -1.130000000000082 | 0.085 | 0.007 | 0.001 |
| -1.125000000000083 | 0.086 | 0.007 | 0.001 |
| -1.120000000000083 | 0.087 | 0.007 | 0.001 |
| -1.115000000000083 | 0.089 | 0.007 | 0.001 |
| -1.110000000000083 | 0.09 | 0.007 | 0.001 |
| -1.105000000000083 | 0.091 | 0.007 | 0.001 |
| -1.100000000000083 | 0.093 | 0.007 | 0.001 |
| -1.095000000000083 | 0.094 | 0.007 | 0.001 |
| -1.090000000000083 | 0.095 | 0.007 | 0.001 |
| -1.085000000000083 | 0.097 | 0.007 | 0.001 |
| -1.080000000000084 | 0.098 | 0.007 | 0.001 |
| -1.075000000000084 | 0.1 | 0.007 | 0.001 |
| -1.070000000000084 | 0.101 | 0.007 | 0.001 |
| -1.065000000000084 | 0.103 | 0.007 | 0.001 |
| -1.060000000000084 | 0.104 | 0.007 | 0.001 |
| -1.055000000000084 | 0.106 | 0.007 | 0.001 |
| -1.050000000000084 | 0.108 | 0.008 | 0.001 |
| -1.045000000000084 | 0.109 | 0.008 | 0.001 |
| -1.040000000000084 | 0.111 | 0.008 | 0.001 |
| -1.035000000000085 | 0.113 | 0.008 | 0.001 |
| -1.030000000000085 | 0.114 | 0.008 | 0.001 |
| -1.025000000000085 | 0.116 | 0.008 | 0.001 |
| -1.020000000000085 | 0.118 | 0.008 | 0.001 |
| -1.015000000000085 | 0.119 | 0.008 | 0.001 |
| -1.010000000000085 | 0.121 | 0.008 | 0.001 |
| -1.005000000000085 | 0.123 | 0.008 | 0.001 |
| -1.000000000000085 | 0.125 | 0.008 | 0.001 |
| -0.995000000000085 | 0.127 | 0.008 | 0.001 |
| -0.990000000000085 | 0.129 | 0.008 | 0.001 |
| -0.985000000000085 | 0.131 | 0.008 | 0.001 |
| -0.980000000000085 | 0.133 | 0.008 | 0.001 |
| -0.975000000000085 | 0.135 | 0.008 | 0.001 |
| -0.970000000000085 | 0.137 | 0.008 | 0.001 |
| -0.965000000000085 | 0.139 | 0.008 | 0.001 |
| -0.960000000000085 | 0.141 | 0.008 | 0.001 |
| -0.955000000000085 | 0.143 | 0.008 | 0.001 |
| -0.950000000000085 | 0.145 | 0.008 | 0.001 |
| -0.945000000000085 | 0.147 | 0.009 | 0.001 |
| -0.940000000000085 | 0.15 | 0.009 | 0.001 |
| -0.935000000000085 | 0.152 | 0.009 | 0.001 |
| -0.930000000000085 | 0.154 | 0.009 | 0.001 |
| -0.925000000000085 | 0.157 | 0.009 | 0.001 |
| -0.920000000000085 | 0.159 | 0.009 | 0.001 |
| -0.915000000000085 | 0.161 | 0.009 | 0.001 |
| -0.910000000000085 | 0.164 | 0.009 | 0.001 |
| -0.905000000000085 | 0.166 | 0.009 | 0.001 |
| -0.900000000000085 | 0.169 | 0.009 | 0.001 |
| -0.895000000000085 | 0.171 | 0.009 | 0.001 |
| -0.890000000000085 | 0.174 | 0.009 | 0.001 |
| -0.885000000000085 | 0.176 | 0.009 | 0.001 |
| -0.880000000000085 | 0.179 | 0.009 | 0.001 |
| -0.875000000000085 | 0.182 | 0.009 | 0.001 |
| -0.870000000000085 | 0.184 | 0.009 | 0.001 |
| -0.865000000000085 | 0.187 | 0.009 | 0.001 |
| -0.860000000000085 | 0.19 | 0.009 | 0.001 |
| -0.855000000000085 | 0.193 | 0.009 | 0.001 |
| -0.850000000000085 | 0.196 | 0.009 | 0.001 |
| -0.845000000000085 | 0.199 | 0.01 | 0.001 |
| -0.840000000000085 | 0.202 | 0.01 | 0.001 |
| -0.835000000000085 | 0.205 | 0.01 | 0.001 |
| -0.830000000000085 | 0.208 | 0.01 | 0.001 |
| -0.825000000000085 | 0.211 | 0.01 | 0.001 |
| -0.820000000000085 | 0.214 | 0.01 | 0.001 |
| -0.815000000000085 | 0.217 | 0.01 | 0.001 |
| -0.810000000000085 | 0.22 | 0.01 | 0.001 |
| -0.805000000000085 | 0.223 | 0.01 | 0.001 |
| -0.800000000000085 | 0.227 | 0.01 | 0.001 |
| -0.795000000000085 | 0.23 | 0.01 | 0.001 |
| -0.790000000000085 | 0.233 | 0.01 | 0.001 |
| -0.785000000000085 | 0.237 | 0.01 | 0.001 |
| -0.780000000000085 | 0.24 | 0.01 | 0.001 |
| -0.775000000000085 | 0.244 | 0.01 | 0.001 |
| -0.770000000000085 | 0.247 | 0.01 | 0.001 |
| -0.765000000000085 | 0.251 | 0.01 | 0.001 |
| -0.760000000000085 | 0.255 | 0.01 | 0.001 |
| -0.755000000000085 | 0.258 | 0.01 | 0.001 |
| -0.750000000000085 | 0.262 | 0.011 | 0.001 |
| -0.745000000000085 | 0.266 | 0.011 | 0.001 |
| -0.740000000000085 | 0.27 | 0.011 | 0.001 |
| -0.735000000000085 | 0.274 | 0.011 | 0.001 |
| -0.730000000000085 | 0.278 | 0.011 | 0.001 |
| -0.725000000000085 | 0.282 | 0.011 | 0.001 |
| -0.720000000000085 | 0.286 | 0.011 | 0.001 |
| -0.715000000000085 | 0.29 | 0.011 | 0.001 |
| -0.710000000000085 | 0.294 | 0.011 | 0.001 |
| -0.705000000000085 | 0.298 | 0.011 | 0.001 |
| -0.700000000000085 | 0.302 | 0.011 | 0.001 |
| -0.695000000000085 | 0.307 | 0.011 | 0.001 |
| -0.690000000000085 | 0.311 | 0.011 | 0.001 |
| -0.685000000000085 | 0.315 | 0.011 | 0.001 |
| -0.680000000000085 | 0.32 | 0.011 | 0.001 |
| -0.675000000000085 | 0.324 | 0.011 | 0.001 |
| -0.670000000000085 | 0.329 | 0.011 | 0.001 |
| -0.665000000000085 | 0.333 | 0.011 | 0.001 |
| -0.660000000000085 | 0.338 | 0.011 | 0.001 |
| -0.655000000000085 | 0.343 | 0.012 | 0.001 |
| -0.650000000000085 | 0.347 | 0.012 | 0.001 |
| -0.645000000000085 | 0.352 | 0.012 | 0.001 |
| -0.640000000000085 | 0.357 | 0.012 | 0.001 |
| -0.635000000000085 | 0.362 | 0.012 | 0.001 |
| -0.630000000000085 | 0.367 | 0.012 | 0.001 |
| -0.625000000000085 | 0.372 | 0.012 | 0.001 |
| -0.620000000000085 | 0.377 | 0.012 | 0.001 |
| -0.615000000000085 | 0.382 | 0.012 | 0.001 |
| -0.610000000000085 | 0.387 | 0.012 | 0.001 |
| -0.605000000000085 | 0.392 | 0.012 | 0.001 |
| -0.600000000000085 | 0.398 | 0.012 | 0.001 |
| -0.595000000000085 | 0.403 | 0.012 | 0.001 |
| -0.590000000000085 | 0.408 | 0.012 | 0.001 |
| -0.585000000000085 | 0.414 | 0.012 | 0.001 |
| -0.580000000000085 | 0.419 | 0.012 | 0.001 |
| -0.575000000000085 | 0.424 | 0.012 | 0.001 |
| -0.570000000000085 | 0.43 | 0.012 | 0.001 |
| -0.565000000000085 | 0.436 | 0.012 | 0.001 |
| -0.560000000000085 | 0.441 | 0.012 | 0.001 |
| -0.555000000000085 | 0.447 | 0.013 | 0.001 |
| -0.550000000000085 | 0.453 | 0.013 | 0.001 |
| -0.545000000000085 | 0.458 | 0.013 | 0.001 |
| -0.540000000000085 | 0.464 | 0.013 | 0.001 |
| -0.535000000000085 | 0.47 | 0.013 | 0.001 |
| -0.530000000000085 | 0.476 | 0.013 | 0.001 |
| -0.525000000000085 | 0.482 | 0.013 | 0.001 |
| -0.520000000000085 | 0.488 | 0.013 | 0.001 |
| -0.515000000000085 | 0.494 | 0.013 | 0.001 |
| -0.510000000000085 | 0.5 | 0.013 | 0.001 |
| -0.505000000000085 | 0.506 | 0.013 | 0.001 |
| -0.500000000000085 | 0.512 | 0.013 | 0.001 |
| -0.495000000000085 | 0.518 | 0.013 | 0.001 |
| -0.490000000000085 | 0.524 | 0.013 | 0.001 |
| -0.485000000000085 | 0.531 | 0.013 | 0.001 |
| -0.480000000000085 | 0.537 | 0.013 | 0.001 |
| -0.475000000000085 | 0.543 | 0.013 | 0.001 |
| -0.470000000000085 | 0.549 | 0.013 | 0.001 |
| -0.465000000000085 | 0.556 | 0.013 | 0.001 |
| -0.460000000000085 | 0.562 | 0.013 | 0.001 |
| -0.455000000000085 | 0.569 | 0.013 | 0.001 |
| -0.450000000000085 | 0.575 | 0.013 | 0.001 |
| -0.445000000000085 | 0.582 | 0.014 | 0.001 |
| -0.440000000000085 | 0.588 | 0.014 | 0.001 |
| -0.435000000000085 | 0.595 | 0.014 | 0.001 |
| -0.430000000000085 | 0.601 | 0.014 | 0.001 |
| -0.425000000000085 | 0.608 | 0.014 | 0.001 |
| -0.420000000000085 | 0.614 | 0.014 | 0.001 |
| -0.415000000000085 | 0.621 | 0.014 | 0.001 |
| -0.410000000000085 | 0.627 | 0.014 | 0.001 |
| -0.405000000000085 | 0.634 | 0.014 | 0.001 |
| -0.400000000000085 | 0.641 | 0.014 | 0.001 |
| -0.395000000000085 | 0.647 | 0.014 | 0.001 |
| -0.390000000000085 | 0.654 | 0.014 | 0.001 |
| -0.385000000000085 | 0.661 | 0.014 | 0.001 |
| -0.380000000000085 | 0.667 | 0.014 | 0.001 |
| -0.375000000000085 | 0.674 | 0.014 | 0.001 |
| -0.370000000000085 | 0.681 | 0.014 | 0.001 |
| -0.365000000000085 | 0.687 | 0.014 | 0.001 |
| -0.360000000000085 | 0.694 | 0.014 | 0.001 |
| -0.355000000000085 | 0.7 | 0.014 | 0.001 |
| -0.350000000000085 | 0.707 | 0.014 | 0.001 |
| -0.345000000000085 | 0.714 | 0.014 | 0.001 |
| -0.340000000000085 | 0.72 | 0.014 | 0.001 |
| -0.335000000000085 | 0.727 | 0.014 | 0.001 |
| -0.330000000000085 | 0.733 | 0.014 | 0.001 |
| -0.325000000000085 | 0.74 | 0.014 | 0.001 |
| -0.320000000000085 | 0.746 | 0.014 | 0.001 |
| -0.315000000000085 | 0.753 | 0.015 | 0.001 |
| -0.310000000000085 | 0.759 | 0.015 | 0.001 |
| -0.305000000000085 | 0.766 | 0.015 | 0.001 |
| -0.300000000000085 | 0.772 | 0.015 | 0.001 |
| -0.295000000000085 | 0.779 | 0.015 | 0.001 |
| -0.290000000000085 | 0.785 | 0.015 | 0.001 |
| -0.285000000000085 | 0.791 | 0.015 | 0.001 |
| -0.280000000000085 | 0.797 | 0.015 | 0.001 |
| -0.275000000000085 | 0.804 | 0.015 | 0.001 |
| -0.270000000000085 | 0.81 | 0.015 | 0.001 |
| -0.265000000000085 | 0.816 | 0.015 | 0.001 |
| -0.260000000000085 | 0.822 | 0.015 | 0.001 |
| -0.255000000000085 | 0.828 | 0.015 | 0.001 |
| -0.250000000000085 | 0.834 | 0.015 | 0.001 |
| -0.245000000000085 | 0.84 | 0.015 | 0.001 |
| -0.240000000000085 | 0.845 | 0.015 | 0.001 |
| -0.235000000000085 | 0.851 | 0.015 | 0.001 |
| -0.230000000000085 | 0.857 | 0.015 | 0.001 |
| -0.225000000000085 | 0.862 | 0.015 | 0.001 |
| -0.220000000000085 | 0.868 | 0.015 | 0.001 |
| -0.215000000000085 | 0.873 | 0.015 | 0.001 |
| -0.210000000000085 | 0.879 | 0.015 | 0.001 |
| -0.205000000000085 | 0.884 | 0.015 | 0.001 |
| -0.200000000000085 | 0.889 | 0.015 | 0.001 |
| -0.195000000000085 | 0.894 | 0.015 | 0.001 |
| -0.190000000000085 | 0.899 | 0.015 | 0.001 |
| -0.185000000000085 | 0.904 | 0.015 | 0.001 |
| -0.180000000000085 | 0.909 | 0.015 | 0.001 |
| -0.175000000000085 | 0.913 | 0.015 | 0.001 |
| -0.170000000000085 | 0.918 | 0.015 | 0.001 |
| -0.165000000000085 | 0.923 | 0.015 | 0.001 |
| -0.160000000000085 | 0.927 | 0.015 | 0.001 |
| -0.155000000000084 | 0.931 | 0.015 | 0.001 |
| -0.150000000000084 | 0.935 | 0.015 | 0.001 |
| -0.145000000000084 | 0.939 | 0.015 | 0.001 |
| -0.140000000000084 | 0.943 | 0.015 | 0.001 |
| -0.135000000000084 | 0.947 | 0.015 | 0.001 |
| -0.130000000000084 | 0.951 | 0.015 | 0.001 |
| -0.125000000000084 | 0.955 | 0.015 | 0.001 |
| -0.120000000000084 | 0.958 | 0.015 | 0.001 |
| -0.115000000000084 | 0.961 | 0.015 | 0.001 |
| -0.110000000000084 | 0.965 | 0.015 | 0.001 |
| -0.105000000000084 | 0.968 | 0.015 | 0.001 |
| -0.100000000000084 | 0.971 | 0.016 | 0.001 |
| -0.0950000000000844 | 0.973 | 0.016 | 0.001 |
| -0.0900000000000844 | 0.976 | 0.016 | 0.001 |
| -0.0850000000000844 | 0.979 | 0.016 | 0.001 |
| -0.0800000000000844 | 0.981 | 0.016 | 0.001 |
| -0.0750000000000844 | 0.983 | 0.016 | 0.001 |
| -0.0700000000000844 | 0.985 | 0.016 | 0.001 |
| -0.0650000000000844 | 0.987 | 0.016 | 0.001 |
| -0.0600000000000844 | 0.989 | 0.016 | 0.001 |
| -0.0550000000000844 | 0.991 | 0.016 | 0.001 |
| -0.0500000000000844 | 0.993 | 0.016 | 0.001 |
| -0.0450000000000844 | 0.994 | 0.016 | 0.001 |
| -0.0400000000000844 | 0.995 | 0.016 | 0.001 |
| -0.0350000000000844 | 0.996 | 0.016 | 0.001 |
| -0.0300000000000844 | 0.997 | 0.016 | 0.001 |
| -0.0250000000000844 | 0.998 | 0.016 | 0.001 |
| -0.0200000000000844 | 0.999 | 0.016 | 0.001 |
| -0.0150000000000844 | 0.999 | 0.016 | 0.001 |
| -0.0100000000000844 | 1 | 0.016 | 0.001 |
| -0.00500000000008444 | 1 | 0.016 | 0.001 |
| -8.4444604087075e-14 | 1 | 0.016 | 0.001 |
| 0.00499999999991555 | 1 | 0.016 | 0.001 |
| 0.00999999999991555 | 1 | 0.016 | 0.001 |
| 0.0149999999999156 | 0.999 | 0.016 | 0.001 |
| 0.0199999999999156 | 0.999 | 0.016 | 0.001 |
| 0.0249999999999156 | 0.998 | 0.016 | 0.001 |
| 0.0299999999999156 | 0.997 | 0.016 | 0.001 |
| 0.0349999999999155 | 0.996 | 0.016 | 0.001 |
| 0.0399999999999155 | 0.995 | 0.016 | 0.001 |
| 0.0449999999999155 | 0.994 | 0.016 | 0.001 |
| 0.0499999999999155 | 0.993 | 0.016 | 0.001 |
| 0.0549999999999155 | 0.991 | 0.016 | 0.001 |
| 0.0599999999999155 | 0.989 | 0.016 | 0.001 |
| 0.0649999999999155 | 0.987 | 0.016 | 0.001 |
| 0.0699999999999155 | 0.985 | 0.016 | 0.001 |
| 0.0749999999999155 | 0.983 | 0.016 | 0.001 |
| 0.0799999999999155 | 0.981 | 0.016 | 0.001 |
| 0.0849999999999155 | 0.979 | 0.016 | 0.001 |
| 0.0899999999999155 | 0.976 | 0.016 | 0.001 |
| 0.0949999999999155 | 0.973 | 0.016 | 0.001 |
| 0.0999999999999155 | 0.971 | 0.016 | 0.001 |
| 0.104999999999916 | 0.968 | 0.015 | 0.001 |
| 0.109999999999916 | 0.965 | 0.015 | 0.001 |
| 0.114999999999916 | 0.961 | 0.015 | 0.001 |
| 0.119999999999916 | 0.958 | 0.015 | 0.001 |
| 0.124999999999916 | 0.955 | 0.015 | 0.001 |
| 0.129999999999916 | 0.951 | 0.015 | 0.001 |
| 0.134999999999916 | 0.947 | 0.015 | 0.001 |
| 0.139999999999916 | 0.943 | 0.015 | 0.001 |
| 0.144999999999916 | 0.939 | 0.015 | 0.001 |
| 0.149999999999916 | 0.935 | 0.015 | 0.001 |
| 0.154999999999916 | 0.931 | 0.015 | 0.001 |
| 0.159999999999916 | 0.927 | 0.015 | 0.001 |
| 0.164999999999916 | 0.923 | 0.015 | 0.001 |
| 0.169999999999916 | 0.918 | 0.015 | 0.001 |
| 0.174999999999916 | 0.913 | 0.015 | 0.001 |
| 0.179999999999916 | 0.909 | 0.015 | 0.001 |
| 0.184999999999916 | 0.904 | 0.015 | 0.001 |
| 0.189999999999916 | 0.899 | 0.015 | 0.001 |
| 0.194999999999916 | 0.894 | 0.015 | 0.001 |
| 0.199999999999916 | 0.889 | 0.015 | 0.001 |
| 0.204999999999916 | 0.884 | 0.015 | 0.001 |
| 0.209999999999916 | 0.879 | 0.015 | 0.001 |
| 0.214999999999916 | 0.873 | 0.015 | 0.001 |
| 0.219999999999916 | 0.868 | 0.015 | 0.001 |
| 0.224999999999916 | 0.862 | 0.015 | 0.001 |
| 0.229999999999916 | 0.857 | 0.015 | 0.001 |
| 0.234999999999916 | 0.851 | 0.015 | 0.001 |
| 0.239999999999916 | 0.845 | 0.015 | 0.001 |
| 0.244999999999916 | 0.84 | 0.015 | 0.001 |
| 0.249999999999916 | 0.834 | 0.015 | 0.001 |
| 0.254999999999916 | 0.828 | 0.015 | 0.001 |
| 0.259999999999916 | 0.822 | 0.015 | 0.001 |
| 0.264999999999916 | 0.816 | 0.015 | 0.001 |
| 0.269999999999916 | 0.81 | 0.015 | 0.001 |
| 0.274999999999916 | 0.804 | 0.015 | 0.001 |
| 0.279999999999916 | 0.797 | 0.015 | 0.001 |
| 0.284999999999916 | 0.791 | 0.015 | 0.001 |
| 0.289999999999916 | 0.785 | 0.015 | 0.001 |
| 0.294999999999916 | 0.779 | 0.015 | 0.001 |
| 0.299999999999916 | 0.772 | 0.015 | 0.001 |
| 0.304999999999916 | 0.766 | 0.015 | 0.001 |
| 0.309999999999916 | 0.759 | 0.015 | 0.001 |
| 0.314999999999916 | 0.753 | 0.015 | 0.001 |
| 0.319999999999916 | 0.746 | 0.014 | 0.001 |
| 0.324999999999916 | 0.74 | 0.014 | 0.001 |
| 0.329999999999916 | 0.733 | 0.014 | 0.001 |
| 0.334999999999916 | 0.727 | 0.014 | 0.001 |
| 0.339999999999916 | 0.72 | 0.014 | 0.001 |
| 0.344999999999916 | 0.714 | 0.014 | 0.001 |
| 0.349999999999916 | 0.707 | 0.014 | 0.001 |
| 0.354999999999916 | 0.7 | 0.014 | 0.001 |
| 0.359999999999916 | 0.694 | 0.014 | 0.001 |
| 0.364999999999916 | 0.687 | 0.014 | 0.001 |
| 0.369999999999916 | 0.681 | 0.014 | 0.001 |
| 0.374999999999916 | 0.674 | 0.014 | 0.001 |
| 0.379999999999916 | 0.667 | 0.014 | 0.001 |
| 0.384999999999916 | 0.661 | 0.014 | 0.001 |
| 0.389999999999916 | 0.654 | 0.014 | 0.001 |
| 0.394999999999916 | 0.647 | 0.014 | 0.001 |
| 0.399999999999916 | 0.641 | 0.014 | 0.001 |
| 0.404999999999916 | 0.634 | 0.014 | 0.001 |
| 0.409999999999916 | 0.627 | 0.014 | 0.001 |
| 0.414999999999916 | 0.621 | 0.014 | 0.001 |
| 0.419999999999916 | 0.614 | 0.014 | 0.001 |
| 0.424999999999916 | 0.608 | 0.014 | 0.001 |
| 0.429999999999916 | 0.601 | 0.014 | 0.001 |
| 0.434999999999916 | 0.595 | 0.014 | 0.001 |
| 0.439999999999916 | 0.588 | 0.014 | 0.001 |
| 0.444999999999916 | 0.582 | 0.014 | 0.001 |
| 0.449999999999916 | 0.575 | 0.013 | 0.001 |
| 0.454999999999916 | 0.569 | 0.013 | 0.001 |
| 0.459999999999916 | 0.562 | 0.013 | 0.001 |
| 0.464999999999916 | 0.556 | 0.013 | 0.001 |
| 0.469999999999916 | 0.549 | 0.013 | 0.001 |
| 0.474999999999916 | 0.543 | 0.013 | 0.001 |
| 0.479999999999916 | 0.537 | 0.013 | 0.001 |
| 0.484999999999916 | 0.531 | 0.013 | 0.001 |
| 0.489999999999916 | 0.524 | 0.013 | 0.001 |
| 0.494999999999916 | 0.518 | 0.013 | 0.001 |
| 0.499999999999916 | 0.512 | 0.013 | 0.001 |
| 0.504999999999916 | 0.506 | 0.013 | 0.001 |
| 0.509999999999916 | 0.5 | 0.013 | 0.001 |
| 0.514999999999916 | 0.494 | 0.013 | 0.001 |
| 0.519999999999916 | 0.488 | 0.013 | 0.001 |
| 0.524999999999916 | 0.482 | 0.013 | 0.001 |
| 0.529999999999916 | 0.476 | 0.013 | 0.001 |
| 0.534999999999916 | 0.47 | 0.013 | 0.001 |
| 0.539999999999916 | 0.464 | 0.013 | 0.001 |
| 0.544999999999916 | 0.458 | 0.013 | 0.001 |
| 0.549999999999916 | 0.453 | 0.013 | 0.001 |
| 0.554999999999916 | 0.447 | 0.013 | 0.001 |
| 0.559999999999916 | 0.441 | 0.012 | 0.001 |
| 0.564999999999916 | 0.436 | 0.012 | 0.001 |
| 0.569999999999916 | 0.43 | 0.012 | 0.001 |
| 0.574999999999916 | 0.424 | 0.012 | 0.001 |
| 0.579999999999916 | 0.419 | 0.012 | 0.001 |
| 0.584999999999916 | 0.414 | 0.012 | 0.001 |
| 0.589999999999916 | 0.408 | 0.012 | 0.001 |
| 0.594999999999916 | 0.403 | 0.012 | 0.001 |
| 0.599999999999916 | 0.398 | 0.012 | 0.001 |
| 0.604999999999916 | 0.392 | 0.012 | 0.001 |
| 0.609999999999916 | 0.387 | 0.012 | 0.001 |
| 0.614999999999916 | 0.382 | 0.012 | 0.001 |
| 0.619999999999916 | 0.377 | 0.012 | 0.001 |
| 0.624999999999916 | 0.372 | 0.012 | 0.001 |
| 0.629999999999916 | 0.367 | 0.012 | 0.001 |
| 0.634999999999916 | 0.362 | 0.012 | 0.001 |
| 0.639999999999916 | 0.357 | 0.012 | 0.001 |
| 0.644999999999916 | 0.352 | 0.012 | 0.001 |
| 0.649999999999916 | 0.347 | 0.012 | 0.001 |
| 0.654999999999916 | 0.343 | 0.012 | 0.001 |
| 0.659999999999916 | 0.338 | 0.011 | 0.001 |
| 0.664999999999916 | 0.333 | 0.011 | 0.001 |
| 0.669999999999916 | 0.329 | 0.011 | 0.001 |
| 0.674999999999916 | 0.324 | 0.011 | 0.001 |
| 0.679999999999916 | 0.32 | 0.011 | 0.001 |
| 0.684999999999916 | 0.315 | 0.011 | 0.001 |
| 0.689999999999916 | 0.311 | 0.011 | 0.001 |
| 0.694999999999916 | 0.307 | 0.011 | 0.001 |
| 0.699999999999916 | 0.302 | 0.011 | 0.001 |
| 0.704999999999916 | 0.298 | 0.011 | 0.001 |
| 0.709999999999916 | 0.294 | 0.011 | 0.001 |
| 0.714999999999916 | 0.29 | 0.011 | 0.001 |
| 0.719999999999916 | 0.286 | 0.011 | 0.001 |
| 0.724999999999916 | 0.282 | 0.011 | 0.001 |
| 0.729999999999916 | 0.278 | 0.011 | 0.001 |
| 0.734999999999916 | 0.274 | 0.011 | 0.001 |
| 0.739999999999916 | 0.27 | 0.011 | 0.001 |
| 0.744999999999916 | 0.266 | 0.011 | 0.001 |
| 0.749999999999916 | 0.262 | 0.011 | 0.001 |
| 0.754999999999916 | 0.258 | 0.01 | 0.001 |
| 0.759999999999916 | 0.255 | 0.01 | 0.001 |
| 0.764999999999916 | 0.251 | 0.01 | 0.001 |
| 0.769999999999916 | 0.247 | 0.01 | 0.001 |
| 0.774999999999916 | 0.244 | 0.01 | 0.001 |
| 0.779999999999916 | 0.24 | 0.01 | 0.001 |
| 0.784999999999916 | 0.237 | 0.01 | 0.001 |
| 0.789999999999916 | 0.233 | 0.01 | 0.001 |
| 0.794999999999916 | 0.23 | 0.01 | 0.001 |
| 0.799999999999916 | 0.227 | 0.01 | 0.001 |
| 0.804999999999916 | 0.223 | 0.01 | 0.001 |
| 0.809999999999916 | 0.22 | 0.01 | 0.001 |
| 0.814999999999916 | 0.217 | 0.01 | 0.001 |
| 0.819999999999916 | 0.214 | 0.01 | 0.001 |
| 0.824999999999916 | 0.211 | 0.01 | 0.001 |
| 0.829999999999916 | 0.208 | 0.01 | 0.001 |
| 0.834999999999916 | 0.205 | 0.01 | 0.001 |
| 0.839999999999916 | 0.202 | 0.01 | 0.001 |
| 0.844999999999916 | 0.199 | 0.01 | 0.001 |
| 0.849999999999916 | 0.196 | 0.009 | 0.001 |
| 0.854999999999916 | 0.193 | 0.009 | 0.001 |
| 0.859999999999916 | 0.19 | 0.009 | 0.001 |
| 0.864999999999916 | 0.187 | 0.009 | 0.001 |
| 0.869999999999916 | 0.184 | 0.009 | 0.001 |
| 0.874999999999916 | 0.182 | 0.009 | 0.001 |
| 0.879999999999916 | 0.179 | 0.009 | 0.001 |
| 0.884999999999916 | 0.176 | 0.009 | 0.001 |
| 0.889999999999916 | 0.174 | 0.009 | 0.001 |
| 0.894999999999916 | 0.171 | 0.009 | 0.001 |
| 0.899999999999916 | 0.169 | 0.009 | 0.001 |
| 0.904999999999916 | 0.166 | 0.009 | 0.001 |
| 0.909999999999916 | 0.164 | 0.009 | 0.001 |
| 0.914999999999916 | 0.161 | 0.009 | 0.001 |
| 0.919999999999916 | 0.159 | 0.009 | 0.001 |
| 0.924999999999916 | 0.157 | 0.009 | 0.001 |
| 0.929999999999916 | 0.154 | 0.009 | 0.001 |
| 0.934999999999916 | 0.152 | 0.009 | 0.001 |
| 0.939999999999916 | 0.15 | 0.009 | 0.001 |
| 0.944999999999916 | 0.147 | 0.009 | 0.001 |
| 0.949999999999916 | 0.145 | 0.008 | 0.001 |
| 0.954999999999916 | 0.143 | 0.008 | 0.001 |
| 0.959999999999916 | 0.141 | 0.008 | 0.001 |
| 0.964999999999916 | 0.139 | 0.008 | 0.001 |
| 0.969999999999916 | 0.137 | 0.008 | 0.001 |
| 0.974999999999916 | 0.135 | 0.008 | 0.001 |
| 0.979999999999916 | 0.133 | 0.008 | 0.001 |
| 0.984999999999916 | 0.131 | 0.008 | 0.001 |
| 0.989999999999916 | 0.129 | 0.008 | 0.001 |
| 0.994999999999916 | 0.127 | 0.008 | 0.001 |
| 0.999999999999916 | 0.125 | 0.008 | 0.001 |
| 1.004999999999916 | 0.123 | 0.008 | 0.001 |
| 1.009999999999916 | 0.121 | 0.008 | 0.001 |
| 1.014999999999916 | 0.119 | 0.008 | 0.001 |
| 1.019999999999916 | 0.118 | 0.008 | 0.001 |
| 1.024999999999916 | 0.116 | 0.008 | 0.001 |
| 1.029999999999916 | 0.114 | 0.008 | 0.001 |
| 1.034999999999916 | 0.113 | 0.008 | 0.001 |
| 1.039999999999915 | 0.111 | 0.008 | 0.001 |
| 1.044999999999915 | 0.109 | 0.008 | 0.001 |
| 1.049999999999915 | 0.108 | 0.008 | 0.001 |
| 1.054999999999915 | 0.106 | 0.007 | 0.001 |
| 1.059999999999915 | 0.104 | 0.007 | 0.001 |
| 1.064999999999915 | 0.103 | 0.007 | 0.001 |
| 1.069999999999915 | 0.101 | 0.007 | 0.001 |
| 1.074999999999915 | 0.1 | 0.007 | 0.001 |
| 1.079999999999915 | 0.098 | 0.007 | 0.001 |
| 1.084999999999914 | 0.097 | 0.007 | 0.001 |
| 1.089999999999914 | 0.095 | 0.007 | 0.001 |
| 1.094999999999914 | 0.094 | 0.007 | 0.001 |
| 1.099999999999914 | 0.093 | 0.007 | 0.001 |
| 1.104999999999914 | 0.091 | 0.007 | 0.001 |
| 1.109999999999914 | 0.09 | 0.007 | 0.001 |
| 1.114999999999914 | 0.089 | 0.007 | 0.001 |
| 1.119999999999914 | 0.087 | 0.007 | 0.001 |
| 1.124999999999914 | 0.086 | 0.007 | 0.001 |
| 1.129999999999914 | 0.085 | 0.007 | 0.001 |
| 1.134999999999913 | 0.083 | 0.007 | 0.001 |
| 1.139999999999913 | 0.082 | 0.007 | 0.001 |
| 1.144999999999913 | 0.081 | 0.007 | 0.001 |
| 1.149999999999913 | 0.08 | 0.007 | 0.001 |
| 1.154999999999913 | 0.079 | 0.007 | 0.001 |
| 1.159999999999913 | 0.077 | 0.007 | 0.001 |
| 1.164999999999913 | 0.076 | 0.007 | 0.001 |
| 1.169999999999913 | 0.075 | 0.006 | 0.001 |
| 1.174999999999913 | 0.074 | 0.006 | 0.001 |
| 1.179999999999912 | 0.073 | 0.006 | 0.001 |
| 1.184999999999912 | 0.072 | 0.006 | 0.001 |
| 1.189999999999912 | 0.071 | 0.006 | 0.001 |
| 1.194999999999912 | 0.07 | 0.006 | 0.001 |
| 1.199999999999912 | 0.069 | 0.006 | 0.001 |
| 1.204999999999912 | 0.068 | 0.006 | 0.001 |
| 1.209999999999912 | 0.067 | 0.006 | 0.001 |
| 1.214999999999912 | 0.066 | 0.006 | 0.001 |
| 1.219999999999912 | 0.065 | 0.006 | 0.001 |
| 1.224999999999911 | 0.064 | 0.006 | 0.001 |
| 1.229999999999911 | 0.063 | 0.006 | 0.001 |
| 1.234999999999911 | 0.062 | 0.006 | 0.001 |
| 1.239999999999911 | 0.061 | 0.006 | 0.001 |
| 1.244999999999911 | 0.06 | 0.006 | 0.001 |
| 1.249999999999911 | 0.059 | 0.006 | 0.001 |
| 1.254999999999911 | 0.059 | 0.006 | 0.001 |
| 1.259999999999911 | 0.058 | 0.006 | 0.001 |
| 1.264999999999911 | 0.057 | 0.006 | 0.001 |
| 1.269999999999911 | 0.056 | 0.006 | 0.001 |
| 1.27499999999991 | 0.055 | 0.006 | 0.001 |
| 1.27999999999991 | 0.054 | 0.006 | 0.001 |
| 1.28499999999991 | 0.054 | 0.006 | 0.001 |
| 1.28999999999991 | 0.053 | 0.006 | 0.001 |
| 1.29499999999991 | 0.052 | 0.005 | 0.001 |
| 1.29999999999991 | 0.051 | 0.005 | 0.001 |
| 1.30499999999991 | 0.051 | 0.005 | 0.001 |
| 1.30999999999991 | 0.05 | 0.005 | 0.001 |
| 1.31499999999991 | 0.049 | 0.005 | 0.001 |
| 1.319999999999909 | 0.048 | 0.005 | 0.001 |
| 1.324999999999909 | 0.048 | 0.005 | 0.001 |
| 1.329999999999909 | 0.047 | 0.005 | 0.001 |
| 1.334999999999909 | 0.046 | 0.005 | 0.001 |
| 1.339999999999909 | 0.046 | 0.005 | 0.001 |
| 1.344999999999909 | 0.045 | 0.005 | 0.001 |
| 1.349999999999909 | 0.044 | 0.005 | 0.001 |
| 1.354999999999909 | 0.044 | 0.005 | 0.001 |
| 1.359999999999909 | 0.043 | 0.005 | 0.001 |
| 1.364999999999908 | 0.043 | 0.005 | 0.001 |
| 1.369999999999908 | 0.042 | 0.005 | 0.001 |
| 1.374999999999908 | 0.041 | 0.005 | 0.001 |
| 1.379999999999908 | 0.041 | 0.005 | 0.001 |
| 1.384999999999908 | 0.04 | 0.005 | 0.001 |
| 1.389999999999908 | 0.04 | 0.005 | 0.001 |
| 1.394999999999908 | 0.039 | 0.005 | 0.001 |
| 1.399999999999908 | 0.039 | 0.005 | 0.001 |
| 1.404999999999908 | 0.038 | 0.005 | 0.001 |
| 1.409999999999908 | 0.037 | 0.005 | 0.001 |
| 1.414999999999907 | 0.037 | 0.005 | 0.001 |
| 1.419999999999907 | 0.036 | 0.005 | 0.001 |
| 1.424999999999907 | 0.036 | 0.005 | 0.001 |
| 1.429999999999907 | 0.035 | 0.005 | 0.001 |
| 1.434999999999907 | 0.035 | 0.004 | 0.001 |
| 1.439999999999907 | 0.034 | 0.004 | 0.001 |
| 1.444999999999907 | 0.034 | 0.004 | 0.001 |
| 1.449999999999907 | 0.033 | 0.004 | 0.001 |
| 1.454999999999907 | 0.033 | 0.004 | 0.001 |
| 1.459999999999906 | 0.033 | 0.004 | 0.001 |
| 1.464999999999906 | 0.032 | 0.004 | 0.001 |
| 1.469999999999906 | 0.032 | 0.004 | 0.001 |
| 1.474999999999906 | 0.031 | 0.004 | 0.001 |
| 1.479999999999906 | 0.031 | 0.004 | 0.001 |
| 1.484999999999906 | 0.03 | 0.004 | 0.001 |
| 1.489999999999906 | 0.03 | 0.004 | 0.001 |
| 1.494999999999906 | 0.03 | 0.004 | 0.001 |
| 1.499999999999906 | 0.029 | 0.004 | 0.001 |
| 1.504999999999906 | 0.029 | 0.004 | 0.001 |
| 1.509999999999905 | 0.028 | 0.004 | 0.001 |
| 1.514999999999905 | 0.028 | 0.004 | 0.001 |
| 1.519999999999905 | 0.028 | 0.004 | 0.001 |
| 1.524999999999905 | 0.027 | 0.004 | 0.001 |
| 1.529999999999905 | 0.027 | 0.004 | 0.001 |
| 1.534999999999905 | 0.026 | 0.004 | 0.001 |
| 1.539999999999905 | 0.026 | 0.004 | 0.001 |
| 1.544999999999905 | 0.026 | 0.004 | 0.001 |
| 1.549999999999905 | 0.025 | 0.004 | 0.001 |
| 1.554999999999904 | 0.025 | 0.004 | 0.001 |
| 1.559999999999904 | 0.025 | 0.004 | 0.001 |
| 1.564999999999904 | 0.024 | 0.004 | 0.001 |
| 1.569999999999904 | 0.024 | 0.004 | 0.001 |
| 1.574999999999904 | 0.024 | 0.004 | 0.001 |
| 1.579999999999904 | 0.023 | 0.004 | 0.001 |
| 1.584999999999904 | 0.023 | 0.004 | 0.001 |
| 1.589999999999904 | 0.023 | 0.004 | 0.001 |
| 1.594999999999904 | 0.022 | 0.004 | 0.001 |
| 1.599999999999903 | 0.022 | 0.004 | 0.001 |
| 1.604999999999903 | 0.022 | 0.004 | 0.001 |
| 1.609999999999903 | 0.022 | 0.003 | 0.001 |
| 1.614999999999903 | 0.021 | 0.003 | 0.001 |
| 1.619999999999903 | 0.021 | 0.003 | 0.001 |
| 1.624999999999903 | 0.021 | 0.003 | 0.001 |
| 1.629999999999903 | 0.02 | 0.003 | 0.001 |
| 1.634999999999903 | 0.02 | 0.003 | 0.001 |
| 1.639999999999903 | 0.02 | 0.003 | 0.001 |
| 1.644999999999902 | 0.02 | 0.003 | 0.001 |
| 1.649999999999902 | 0.019 | 0.003 | 0.001 |
| 1.654999999999902 | 0.019 | 0.003 | 0.001 |
| 1.659999999999902 | 0.019 | 0.003 | 0.001 |
| 1.664999999999902 | 0.019 | 0.003 | 0.001 |
| 1.669999999999902 | 0.018 | 0.003 | 0.001 |
| 1.674999999999902 | 0.018 | 0.003 | 0.001 |
| 1.679999999999902 | 0.018 | 0.003 | 0.001 |
| 1.684999999999902 | 0.018 | 0.003 | 0.001 |
| 1.689999999999901 | 0.017 | 0.003 | 0.001 |
| 1.694999999999901 | 0.017 | 0.003 | 0.001 |
| 1.699999999999901 | 0.017 | 0.003 | 0.001 |
| 1.704999999999901 | 0.017 | 0.003 | 0.001 |
| 1.709999999999901 | 0.017 | 0.003 | 0.001 |
| 1.714999999999901 | 0.016 | 0.003 | 0.001 |
| 1.719999999999901 | 0.016 | 0.003 | 0.001 |
| 1.724999999999901 | 0.016 | 0.003 | 0.001 |
| 1.729999999999901 | 0.016 | 0.003 | 0.001 |
| 1.734999999999901 | 0.016 | 0.003 | 0.001 |
| 1.7399999999999 | 0.015 | 0.003 | 0.001 |
| 1.7449999999999 | 0.015 | 0.003 | 0.001 |
| 1.7499999999999 | 0.015 | 0.003 | 0.001 |
| 1.7549999999999 | 0.015 | 0.003 | 0.001 |
| 1.7599999999999 | 0.015 | 0.003 | 0.001 |
| 1.7649999999999 | 0.014 | 0.003 | 0.001 |
| 1.7699999999999 | 0.014 | 0.003 | 0.001 |
| 1.7749999999999 | 0.014 | 0.003 | 0.001 |
| 1.7799999999999 | 0.014 | 0.003 | 0.001 |
| 1.784999999999899 | 0.014 | 0.003 | 0.001 |
| 1.789999999999899 | 0.013 | 0.003 | 0.001 |
| 1.794999999999899 | 0.013 | 0.003 | 0.001 |
| 1.799999999999899 | 0.013 | 0.003 | 0.001 |
| 1.804999999999899 | 0.013 | 0.003 | 0.001 |
| 1.809999999999899 | 0.013 | 0.003 | 0.001 |
| 1.814999999999899 | 0.013 | 0.003 | 0.001 |
| 1.819999999999899 | 0.012 | 0.003 | 0.001 |
| 1.824999999999899 | 0.012 | 0.003 | 0.001 |
| 1.829999999999899 | 0.012 | 0.003 | 0.001 |
| 1.834999999999898 | 0.012 | 0.003 | 0.001 |
| 1.839999999999898 | 0.012 | 0.002 | 0.001 |
| 1.844999999999898 | 0.012 | 0.002 | 0.001 |
| 1.849999999999898 | 0.012 | 0.002 | 0.001 |
| 1.854999999999898 | 0.011 | 0.002 | 0.001 |
| 1.859999999999898 | 0.011 | 0.002 | 0.001 |
| 1.864999999999898 | 0.011 | 0.002 | 0.001 |
| 1.869999999999898 | 0.011 | 0.002 | 0.001 |
| 1.874999999999898 | 0.011 | 0.002 | 0.001 |
| 1.879999999999897 | 0.011 | 0.002 | 0.001 |
| 1.884999999999897 | 0.011 | 0.002 | 0.001 |
| 1.889999999999897 | 0.01 | 0.002 | 0.001 |
| 1.894999999999897 | 0.01 | 0.002 | 0.001 |
| 1.899999999999897 | 0.01 | 0.002 | 0 |
| 1.904999999999897 | 0.01 | 0.002 | 0 |
| 1.909999999999897 | 0.01 | 0.002 | 0 |
| 1.914999999999897 | 0.01 | 0.002 | 0 |
| 1.919999999999897 | 0.01 | 0.002 | 0 |
| 1.924999999999897 | 0.01 | 0.002 | 0 |
| 1.929999999999896 | 0.009 | 0.002 | 0 |
| 1.934999999999896 | 0.009 | 0.002 | 0 |
| 1.939999999999896 | 0.009 | 0.002 | 0 |
| 1.944999999999896 | 0.009 | 0.002 | 0 |
| 1.949999999999896 | 0.009 | 0.002 | 0 |
| 1.954999999999896 | 0.009 | 0.002 | 0 |
| 1.959999999999896 | 0.009 | 0.002 | 0 |
| 1.964999999999896 | 0.009 | 0.002 | 0 |
| 1.969999999999896 | 0.009 | 0.002 | 0 |
| 1.974999999999895 | 0.008 | 0.002 | 0 |
| 1.979999999999895 | 0.008 | 0.002 | 0 |
| 1.984999999999895 | 0.008 | 0.002 | 0 |
| 1.989999999999895 | 0.008 | 0.002 | 0 |
| 1.994999999999895 | 0.008 | 0.002 | 0 |
| 1.999999999999895 | 0.008 | 0.002 | 0 |
| 2.004999999999895 | 0.008 | 0.002 | 0 |
| 2.009999999999895 | 0.008 | 0.002 | 0 |
| 2.014999999999895 | 0.008 | 0.002 | 0 |
| 2.019999999999895 | 0.008 | 0.002 | 0 |
| 2.024999999999895 | 0.008 | 0.002 | 0 |
| 2.029999999999895 | 0.007 | 0.002 | 0 |
| 2.034999999999894 | 0.007 | 0.002 | 0 |
| 2.039999999999894 | 0.007 | 0.002 | 0 |
| 2.044999999999894 | 0.007 | 0.002 | 0 |
| 2.049999999999894 | 0.007 | 0.002 | 0 |
| 2.054999999999894 | 0.007 | 0.002 | 0 |
| 2.059999999999894 | 0.007 | 0.002 | 0 |
| 2.064999999999894 | 0.007 | 0.002 | 0 |
| 2.069999999999894 | 0.007 | 0.002 | 0 |
| 2.074999999999894 | 0.007 | 0.002 | 0 |
| 2.079999999999893 | 0.007 | 0.002 | 0 |
| 2.084999999999893 | 0.007 | 0.002 | 0 |
| 2.089999999999893 | 0.006 | 0.002 | 0 |
| 2.094999999999893 | 0.006 | 0.002 | 0 |
| 2.099999999999893 | 0.006 | 0.002 | 0 |
| 2.104999999999893 | 0.006 | 0.002 | 0 |
| 2.109999999999893 | 0.006 | 0.002 | 0 |
| 2.114999999999893 | 0.006 | 0.002 | 0 |
| 2.119999999999893 | 0.006 | 0.002 | 0 |
| 2.124999999999893 | 0.006 | 0.002 | 0 |
| 2.129999999999892 | 0.006 | 0.002 | 0 |
| 2.134999999999892 | 0.006 | 0.002 | 0 |
| 2.139999999999892 | 0.006 | 0.002 | 0 |
| 2.144999999999892 | 0.006 | 0.002 | 0 |
| 2.149999999999892 | 0.006 | 0.002 | 0 |
| 2.154999999999892 | 0.006 | 0.002 | 0 |
| 2.159999999999892 | 0.005 | 0.002 | 0 |
| 2.164999999999892 | 0.005 | 0.002 | 0 |
| 2.169999999999892 | 0.005 | 0.002 | 0 |
| 2.174999999999891 | 0.005 | 0.002 | 0 |
| 2.179999999999891 | 0.005 | 0.001 | 0 |
| 2.184999999999891 | 0.005 | 0.001 | 0 |
| 2.189999999999891 | 0.005 | 0.001 | 0 |
| 2.194999999999891 | 0.005 | 0.001 | 0 |
| 2.199999999999891 | 0.005 | 0.001 | 0 |
| 2.204999999999891 | 0.005 | 0.001 | 0 |
| 2.209999999999891 | 0.005 | 0.001 | 0 |
| 2.214999999999891 | 0.005 | 0.001 | 0 |
| 2.21999999999989 | 0.005 | 0.001 | 0 |
| 2.22499999999989 | 0.005 | 0.001 | 0 |
| 2.22999999999989 | 0.005 | 0.001 | 0 |
| 2.23499999999989 | 0.005 | 0.001 | 0 |
| 2.23999999999989 | 0.005 | 0.001 | 0 |
| 2.24499999999989 | 0.005 | 0.001 | 0 |
| 2.24999999999989 | 0.004 | 0.001 | 0 |
| 2.25499999999989 | 0.004 | 0.001 | 0 |
| 2.25999999999989 | 0.004 | 0.001 | 0 |
| 2.26499999999989 | 0.004 | 0.001 | 0 |
| 2.269999999999889 | 0.004 | 0.001 | 0 |
| 2.274999999999889 | 0.004 | 0.001 | 0 |
| 2.279999999999889 | 0.004 | 0.001 | 0 |
| 2.284999999999889 | 0.004 | 0.001 | 0 |
| 2.289999999999889 | 0.004 | 0.001 | 0 |
| 2.294999999999889 | 0.004 | 0.001 | 0 |
| 2.299999999999889 | 0.004 | 0.001 | 0 |
| 2.304999999999889 | 0.004 | 0.001 | 0 |
| 2.309999999999889 | 0.004 | 0.001 | 0 |
| 2.314999999999888 | 0.004 | 0.001 | 0 |
| 2.319999999999888 | 0.004 | 0.001 | 0 |
| 2.324999999999888 | 0.004 | 0.001 | 0 |
| 2.329999999999888 | 0.004 | 0.001 | 0 |
| 2.334999999999888 | 0.004 | 0.001 | 0 |
| 2.339999999999888 | 0.004 | 0.001 | 0 |
| 2.344999999999888 | 0.004 | 0.001 | 0 |
| 2.349999999999888 | 0.004 | 0.001 | 0 |
| 2.354999999999888 | 0.004 | 0.001 | 0 |
| 2.359999999999887 | 0.004 | 0.001 | 0 |
| 2.364999999999887 | 0.003 | 0.001 | 0 |
| 2.369999999999887 | 0.003 | 0.001 | 0 |
| 2.374999999999887 | 0.003 | 0.001 | 0 |
| 2.379999999999887 | 0.003 | 0.001 | 0 |
| 2.384999999999887 | 0.003 | 0.001 | 0 |
| 2.389999999999887 | 0.003 | 0.001 | 0 |
| 2.394999999999887 | 0.003 | 0.001 | 0 |
| 2.399999999999887 | 0.003 | 0.001 | 0 |
| 2.404999999999887 | 0.003 | 0.001 | 0 |
| 2.409999999999886 | 0.003 | 0.001 | 0 |
| 2.414999999999886 | 0.003 | 0.001 | 0 |
| 2.419999999999886 | 0.003 | 0.001 | 0 |
| 2.424999999999886 | 0.003 | 0.001 | 0 |
| 2.429999999999886 | 0.003 | 0.001 | 0 |
| 2.434999999999886 | 0.003 | 0.001 | 0 |
| 2.439999999999886 | 0.003 | 0.001 | 0 |
| 2.444999999999886 | 0.003 | 0.001 | 0 |
| 2.449999999999886 | 0.003 | 0.001 | 0 |
| 2.454999999999885 | 0.003 | 0.001 | 0 |
| 2.459999999999885 | 0.003 | 0.001 | 0 |
| 2.464999999999885 | 0.003 | 0.001 | 0 |
| 2.469999999999885 | 0.003 | 0.001 | 0 |
| 2.474999999999885 | 0.003 | 0.001 | 0 |
| 2.479999999999885 | 0.003 | 0.001 | 0 |
| 2.484999999999885 | 0.003 | 0.001 | 0 |
| 2.489999999999885 | 0.003 | 0.001 | 0 |
| 2.494999999999885 | 0.003 | 0.001 | 0 |
| 2.499999999999884 | 0.003 | 0.001 | 0 |
| 2.504999999999884 | 0.003 | 0.001 | 0 |
| 2.509999999999884 | 0.003 | 0.001 | 0 |
| 2.514999999999884 | 0.003 | 0.001 | 0 |
| 2.519999999999884 | 0.003 | 0.001 | 0 |
| 2.524999999999884 | 0.002 | 0.001 | 0 |
| 2.529999999999884 | 0.002 | 0.001 | 0 |
| 2.534999999999884 | 0.002 | 0.001 | 0 |
| 2.539999999999884 | 0.002 | 0.001 | 0 |
| 2.544999999999884 | 0.002 | 0.001 | 0 |
| 2.549999999999883 | 0.002 | 0.001 | 0 |
| 2.554999999999883 | 0.002 | 0.001 | 0 |
| 2.559999999999883 | 0.002 | 0.001 | 0 |
| 2.564999999999883 | 0.002 | 0.001 | 0 |
| 2.569999999999883 | 0.002 | 0.001 | 0 |
| 2.574999999999883 | 0.002 | 0.001 | 0 |
| 2.579999999999883 | 0.002 | 0.001 | 0 |
| 2.584999999999883 | 0.002 | 0.001 | 0 |
| 2.589999999999883 | 0.002 | 0.001 | 0 |
| 2.594999999999882 | 0.002 | 0.001 | 0 |
| 2.599999999999882 | 0.002 | 0.001 | 0 |
| 2.604999999999882 | 0.002 | 0.001 | 0 |
| 2.609999999999882 | 0.002 | 0.001 | 0 |
| 2.614999999999882 | 0.002 | 0.001 | 0 |
| 2.619999999999882 | 0.002 | 0.001 | 0 |
| 2.624999999999882 | 0.002 | 0.001 | 0 |
| 2.629999999999882 | 0.002 | 0.001 | 0 |
| 2.634999999999882 | 0.002 | 0.001 | 0 |
| 2.639999999999881 | 0.002 | 0.001 | 0 |
| 2.644999999999881 | 0.002 | 0.001 | 0 |
| 2.649999999999881 | 0.002 | 0.001 | 0 |
| 2.654999999999881 | 0.002 | 0.001 | 0 |
| 2.659999999999881 | 0.002 | 0.001 | 0 |
| 2.664999999999881 | 0.002 | 0.001 | 0 |
| 2.669999999999881 | 0.002 | 0.001 | 0 |
| 2.674999999999881 | 0.002 | 0.001 | 0 |
| 2.679999999999881 | 0.002 | 0.001 | 0 |
| 2.68499999999988 | 0.002 | 0.001 | 0 |
| 2.68999999999988 | 0.002 | 0.001 | 0 |
| 2.69499999999988 | 0.002 | 0.001 | 0 |
| 2.69999999999988 | 0.002 | 0.001 | 0 |
| 2.70499999999988 | 0.002 | 0.001 | 0 |
| 2.70999999999988 | 0.002 | 0.001 | 0 |
| 2.71499999999988 | 0.002 | 0.001 | 0 |
| 2.71999999999988 | 0.002 | 0.001 | 0 |
| 2.72499999999988 | 0.002 | 0.001 | 0 |
| 2.72999999999988 | 0.002 | 0.001 | 0 |
| 2.734999999999879 | 0.002 | 0.001 | 0 |
| 2.739999999999879 | 0.002 | 0.001 | 0 |
| 2.744999999999879 | 0.002 | 0.001 | 0 |
| 2.749999999999879 | 0.002 | 0.001 | 0 |
| 2.754999999999879 | 0.002 | 0.001 | 0 |
| 2.759999999999879 | 0.002 | 0.001 | 0 |
| 2.764999999999879 | 0.002 | 0.001 | 0 |
| 2.769999999999879 | 0.002 | 0.001 | 0 |
| 2.774999999999879 | 0.002 | 0.001 | 0 |
| 2.779999999999878 | 0.002 | 0.001 | 0 |
| 2.784999999999878 | 0.001 | 0.001 | 0 |
| 2.789999999999878 | 0.001 | 0.001 | 0 |
| 2.794999999999878 | 0.001 | 0.001 | 0 |
| 2.799999999999878 | 0.001 | 0.001 | 0 |
| 2.804999999999878 | 0.001 | 0.001 | 0 |
| 2.809999999999878 | 0.001 | 0.001 | 0 |
| 2.814999999999878 | 0.001 | 0.001 | 0 |
| 2.819999999999878 | 0.001 | 0.001 | 0 |
| 2.824999999999878 | 0.001 | 0.001 | 0 |
| 2.829999999999877 | 0.001 | 0.001 | 0 |
| 2.834999999999877 | 0.001 | 0.001 | 0 |
| 2.839999999999877 | 0.001 | 0.001 | 0 |
| 2.844999999999877 | 0.001 | 0.001 | 0 |
| 2.849999999999877 | 0.001 | 0.001 | 0 |
| 2.854999999999877 | 0.001 | 0.001 | 0 |
| 2.859999999999877 | 0.001 | 0.001 | 0 |
| 2.864999999999877 | 0.001 | 0.001 | 0 |
| 2.869999999999877 | 0.001 | 0.001 | 0 |
| 2.874999999999876 | 0.001 | 0.001 | 0 |
| 2.879999999999876 | 0.001 | 0.001 | 0 |
| 2.884999999999876 | 0.001 | 0.001 | 0 |
| 2.889999999999876 | 0.001 | 0.001 | 0 |
| 2.894999999999876 | 0.001 | 0.001 | 0 |
| 2.899999999999876 | 0.001 | 0.001 | 0 |
| 2.904999999999876 | 0.001 | 0.001 | 0 |
| 2.909999999999876 | 0.001 | 0.001 | 0 |
| 2.914999999999876 | 0.001 | 0.001 | 0 |
| 2.919999999999876 | 0.001 | 0.001 | 0 |
| 2.924999999999875 | 0.001 | 0.001 | 0 |
| 2.929999999999875 | 0.001 | 0.001 | 0 |
| 2.934999999999875 | 0.001 | 0 | 0 |
| 2.939999999999875 | 0.001 | 0 | 0 |
| 2.944999999999875 | 0.001 | 0 | 0 |
| 2.949999999999875 | 0.001 | 0 | 0 |
| 2.954999999999875 | 0.001 | 0 | 0 |
| 2.959999999999875 | 0.001 | 0 | 0 |
| 2.964999999999875 | 0.001 | 0 | 0 |
| 2.969999999999874 | 0.001 | 0 | 0 |
| 2.974999999999874 | 0.001 | 0 | 0 |
| 2.979999999999874 | 0.001 | 0 | 0 |
| 2.984999999999874 | 0.001 | 0 | 0 |
| 2.989999999999874 | 0.001 | 0 | 0 |
| 2.994999999999874 | 0.001 | 0 | 0 |
| 2.999999999999874 | 0.001 | 0 | 0 |
| 3.004999999999874 | 0.001 | 0 | 0 |
| 3.009999999999874 | 0.001 | 0 | 0 |
| 3.014999999999874 | 0.001 | 0 | 0 |
| 3.019999999999873 | 0.001 | 0 | 0 |
| 3.024999999999873 | 0.001 | 0 | 0 |
| 3.029999999999873 | 0.001 | 0 | 0 |
| 3.034999999999873 | 0.001 | 0 | 0 |
| 3.039999999999873 | 0.001 | 0 | 0 |
| 3.044999999999873 | 0.001 | 0 | 0 |
| 3.049999999999873 | 0.001 | 0 | 0 |
| 3.054999999999873 | 0.001 | 0 | 0 |
| 3.059999999999873 | 0.001 | 0 | 0 |
| 3.064999999999872 | 0.001 | 0 | 0 |
| 3.069999999999872 | 0.001 | 0 | 0 |
| 3.074999999999872 | 0.001 | 0 | 0 |
| 3.079999999999872 | 0.001 | 0 | 0 |
| 3.084999999999872 | 0.001 | 0 | 0 |
| 3.089999999999872 | 0.001 | 0 | 0 |
| 3.094999999999872 | 0.001 | 0 | 0 |
| 3.099999999999872 | 0.001 | 0 | 0 |
| 3.104999999999872 | 0.001 | 0 | 0 |
| 3.109999999999872 | 0.001 | 0 | 0 |
| 3.114999999999871 | 0.001 | 0 | 0 |
| 3.119999999999871 | 0.001 | 0 | 0 |
| 3.124999999999871 | 0.001 | 0 | 0 |
| 3.129999999999871 | 0.001 | 0 | 0 |
| 3.134999999999871 | 0.001 | 0 | 0 |
| 3.139999999999871 | 0.001 | 0 | 0 |
| 3.144999999999871 | 0.001 | 0 | 0 |
| 3.149999999999871 | 0.001 | 0 | 0 |
| 3.154999999999871 | 0.001 | 0 | 0 |
| 3.15999999999987 | 0.001 | 0 | 0 |
| 3.16499999999987 | 0.001 | 0 | 0 |
| 3.16999999999987 | 0.001 | 0 | 0 |
| 3.17499999999987 | 0.001 | 0 | 0 |
| 3.17999999999987 | 0.001 | 0 | 0 |
| 3.18499999999987 | 0.001 | 0 | 0 |
| 3.18999999999987 | 0.001 | 0 | 0 |
| 3.19499999999987 | 0.001 | 0 | 0 |
| 3.19999999999987 | 0.001 | 0 | 0 |
| 3.204999999999869 | 0.001 | 0 | 0 |
| 3.209999999999869 | 0.001 | 0 | 0 |
| 3.214999999999869 | 0.001 | 0 | 0 |
| 3.219999999999869 | 0.001 | 0 | 0 |
| 3.224999999999869 | 0.001 | 0 | 0 |
| 3.229999999999869 | 0.001 | 0 | 0 |
| 3.234999999999869 | 0.001 | 0 | 0 |
| 3.239999999999869 | 0.001 | 0 | 0 |
| 3.244999999999869 | 0.001 | 0 | 0 |
| 3.249999999999869 | 0.001 | 0 | 0 |
| 3.254999999999868 | 0.001 | 0 | 0 |
| 3.259999999999868 | 0.001 | 0 | 0 |
| 3.264999999999868 | 0.001 | 0 | 0 |
| 3.269999999999868 | 0.001 | 0 | 0 |
| 3.274999999999868 | 0.001 | 0 | 0 |
| 3.279999999999868 | 0.001 | 0 | 0 |
| 3.284999999999868 | 0.001 | 0 | 0 |
| 3.289999999999868 | 0.001 | 0 | 0 |
| 3.294999999999868 | 0.001 | 0 | 0 |
| 3.299999999999867 | 0.001 | 0 | 0 |
| 3.304999999999867 | 0.001 | 0 | 0 |
| 3.309999999999867 | 0.001 | 0 | 0 |
| 3.314999999999867 | 0.001 | 0 | 0 |
| 3.319999999999867 | 0.001 | 0 | 0 |
| 3.324999999999867 | 0.001 | 0 | 0 |
| 3.329999999999867 | 0.001 | 0 | 0 |
| 3.334999999999867 | 0.001 | 0 | 0 |
| 3.339999999999867 | 0.001 | 0 | 0 |
| 3.344999999999866 | 0.001 | 0 | 0 |
| 3.349999999999866 | 0.001 | 0 | 0 |
| 3.354999999999866 | 0.001 | 0 | 0 |
| 3.359999999999866 | 0.001 | 0 | 0 |
| 3.364999999999866 | 0.001 | 0 | 0 |
| 3.369999999999866 | 0.001 | 0 | 0 |
| 3.374999999999866 | 0.001 | 0 | 0 |
| 3.379999999999866 | 0.001 | 0 | 0 |
| 3.384999999999866 | 0.001 | 0 | 0 |
| 3.389999999999866 | 0.001 | 0 | 0 |
| 3.394999999999865 | 0.001 | 0 | 0 |
| 3.399999999999865 | 0.001 | 0 | 0 |
| 3.404999999999865 | 0.001 | 0 | 0 |
| 3.409999999999865 | 0 | 0 | 0 |
| 3.414999999999865 | 0 | 0 | 0 |
| 3.419999999999865 | 0 | 0 | 0 |
| 3.424999999999865 | 0 | 0 | 0 |
| 3.429999999999865 | 0 | 0 | 0 |
| 3.434999999999865 | 0 | 0 | 0 |
| 3.439999999999864 | 0 | 0 | 0 |
| 3.444999999999864 | 0 | 0 | 0 |
| 3.449999999999864 | 0 | 0 | 0 |
| 3.454999999999864 | 0 | 0 | 0 |
| 3.459999999999864 | 0 | 0 | 0 |
| 3.464999999999864 | 0 | 0 | 0 |
| 3.469999999999864 | 0 | 0 | 0 |
| 3.474999999999864 | 0 | 0 | 0 |
| 3.479999999999864 | 0 | 0 | 0 |
| 3.484999999999864 | 0 | 0 | 0 |
| 3.489999999999863 | 0 | 0 | 0 |
| 3.494999999999863 | 0 | 0 | 0 |
| 3.499999999999863 | 0 | 0 | 0 |
| 3.504999999999863 | 0 | 0 | 0 |
| 3.509999999999863 | 0 | 0 | 0 |
| 3.514999999999863 | 0 | 0 | 0 |
| 3.519999999999863 | 0 | 0 | 0 |
| 3.524999999999863 | 0 | 0 | 0 |
| 3.529999999999863 | 0 | 0 | 0 |
| 3.534999999999862 | 0 | 0 | 0 |
| 3.539999999999862 | 0 | 0 | 0 |
| 3.544999999999862 | 0 | 0 | 0 |
| 3.549999999999862 | 0 | 0 | 0 |
| 3.554999999999862 | 0 | 0 | 0 |
| 3.559999999999862 | 0 | 0 | 0 |
| 3.564999999999862 | 0 | 0 | 0 |
| 3.569999999999862 | 0 | 0 | 0 |
| 3.574999999999862 | 0 | 0 | 0 |
| 3.579999999999862 | 0 | 0 | 0 |
| 3.584999999999861 | 0 | 0 | 0 |
| 3.589999999999861 | 0 | 0 | 0 |
| 3.594999999999861 | 0 | 0 | 0 |
| 3.599999999999861 | 0 | 0 | 0 |
| 3.604999999999861 | 0 | 0 | 0 |
| 3.609999999999861 | 0 | 0 | 0 |
| 3.614999999999861 | 0 | 0 | 0 |
| 3.619999999999861 | 0 | 0 | 0 |
| 3.62499999999986 | 0 | 0 | 0 |
| 3.62999999999986 | 0 | 0 | 0 |
| 3.63499999999986 | 0 | 0 | 0 |
| 3.63999999999986 | 0 | 0 | 0 |
| 3.64499999999986 | 0 | 0 | 0 |
| 3.64999999999986 | 0 | 0 | 0 |
| 3.65499999999986 | 0 | 0 | 0 |
| 3.65999999999986 | 0 | 0 | 0 |
| 3.66499999999986 | 0 | 0 | 0 |
| 3.669999999999859 | 0 | 0 | 0 |
| 3.674999999999859 | 0 | 0 | 0 |
| 3.679999999999859 | 0 | 0 | 0 |
| 3.684999999999859 | 0 | 0 | 0 |
| 3.689999999999859 | 0 | 0 | 0 |
| 3.694999999999859 | 0 | 0 | 0 |
| 3.699999999999859 | 0 | 0 | 0 |
| 3.704999999999859 | 0 | 0 | 0 |
| 3.709999999999859 | 0 | 0 | 0 |
| 3.714999999999859 | 0 | 0 | 0 |
| 3.719999999999858 | 0 | 0 | 0 |
| 3.724999999999858 | 0 | 0 | 0 |
| 3.729999999999858 | 0 | 0 | 0 |
| 3.734999999999858 | 0 | 0 | 0 |
| 3.739999999999858 | 0 | 0 | 0 |
| 3.744999999999858 | 0 | 0 | 0 |
| 3.749999999999858 | 0 | 0 | 0 |
| 3.754999999999858 | 0 | 0 | 0 |
| 3.759999999999858 | 0 | 0 | 0 |
| 3.764999999999857 | 0 | 0 | 0 |
| 3.769999999999857 | 0 | 0 | 0 |
| 3.774999999999857 | 0 | 0 | 0 |
| 3.779999999999857 | 0 | 0 | 0 |
| 3.784999999999857 | 0 | 0 | 0 |
| 3.789999999999857 | 0 | 0 | 0 |
| 3.794999999999857 | 0 | 0 | 0 |
| 3.799999999999857 | 0 | 0 | 0 |
| 3.804999999999857 | 0 | 0 | 0 |
| 3.809999999999857 | 0 | 0 | 0 |
| 3.814999999999856 | 0 | 0 | 0 |
| 3.819999999999856 | 0 | 0 | 0 |
| 3.824999999999856 | 0 | 0 | 0 |
| 3.829999999999856 | 0 | 0 | 0 |
| 3.834999999999856 | 0 | 0 | 0 |
| 3.839999999999856 | 0 | 0 | 0 |
| 3.844999999999856 | 0 | 0 | 0 |
| 3.849999999999856 | 0 | 0 | 0 |
| 3.854999999999856 | 0 | 0 | 0 |
| 3.859999999999855 | 0 | 0 | 0 |
| 3.864999999999855 | 0 | 0 | 0 |
| 3.869999999999855 | 0 | 0 | 0 |
| 3.874999999999855 | 0 | 0 | 0 |
| 3.879999999999855 | 0 | 0 | 0 |
| 3.884999999999855 | 0 | 0 | 0 |
| 3.889999999999855 | 0 | 0 | 0 |
| 3.894999999999855 | 0 | 0 | 0 |
| 3.899999999999855 | 0 | 0 | 0 |
| 3.904999999999855 | 0 | 0 | 0 |
| 3.909999999999854 | 0 | 0 | 0 |
| 3.914999999999854 | 0 | 0 | 0 |
| 3.919999999999854 | 0 | 0 | 0 |
| 3.924999999999854 | 0 | 0 | 0 |
| 3.929999999999854 | 0 | 0 | 0 |
| 3.934999999999854 | 0 | 0 | 0 |
| 3.939999999999854 | 0 | 0 | 0 |
| 3.944999999999854 | 0 | 0 | 0 |
| 3.949999999999854 | 0 | 0 | 0 |
| 3.954999999999853 | 0 | 0 | 0 |
| 3.959999999999853 | 0 | 0 | 0 |
| 3.964999999999853 | 0 | 0 | 0 |
| 3.969999999999853 | 0 | 0 | 0 |
| 3.974999999999853 | 0 | 0 | 0 |
| 3.979999999999853 | 0 | 0 | 0 |
| 3.984999999999853 | 0 | 0 | 0 |
| 3.989999999999853 | 0 | 0 | 0 |
| 3.994999999999853 | 0 | 0 | 0 |
| 3.999999999999853 | 0 | 0 | 0 |
| 4.004999999999852 | 0 | 0 | 0 |
| 4.009999999999852 | 0 | 0 | 0 |
| 4.014999999999852 | 0 | 0 | 0 |
| 4.019999999999852 | 0 | 0 | 0 |
| 4.024999999999852 | 0 | 0 | 0 |
| 4.029999999999852 | 0 | 0 | 0 |
| 4.034999999999852 | 0 | 0 | 0 |
| 4.039999999999851 | 0 | 0 | 0 |
| 4.044999999999852 | 0 | 0 | 0 |
| 4.049999999999851 | 0 | 0 | 0 |
| 4.054999999999851 | 0 | 0 | 0 |
| 4.059999999999851 | 0 | 0 | 0 |
| 4.064999999999851 | 0 | 0 | 0 |
| 4.069999999999851 | 0 | 0 | 0 |
| 4.074999999999851 | 0 | 0 | 0 |
| 4.07999999999985 | 0 | 0 | 0 |
| 4.084999999999851 | 0 | 0 | 0 |
| 4.08999999999985 | 0 | 0 | 0 |
| 4.094999999999851 | 0 | 0 | 0 |
| 4.09999999999985 | 0 | 0 | 0 |
| 4.10499999999985 | 0 | 0 | 0 |
| 4.10999999999985 | 0 | 0 | 0 |
| 4.11499999999985 | 0 | 0 | 0 |
| 4.11999999999985 | 0 | 0 | 0 |
| 4.12499999999985 | 0 | 0 | 0 |
| 4.12999999999985 | 0 | 0 | 0 |
| 4.13499999999985 | 0 | 0 | 0 |
| 4.13999999999985 | 0 | 0 | 0 |
| 4.144999999999849 | 0 | 0 | 0 |
| 4.14999999999985 | 0 | 0 | 0 |
| 4.154999999999849 | 0 | 0 | 0 |
| 4.15999999999985 | 0 | 0 | 0 |
| 4.164999999999849 | 0 | 0 | 0 |
| 4.169999999999849 | 0 | 0 | 0 |
| 4.174999999999849 | 0 | 0 | 0 |
| 4.179999999999848 | 0 | 0 | 0 |
| 4.184999999999849 | 0 | 0 | 0 |
| 4.189999999999848 | 0 | 0 | 0 |
| 4.194999999999848 | 0 | 0 | 0 |
| 4.199999999999848 | 0 | 0 | 0 |
| 4.204999999999848 | 0 | 0 | 0 |
| 4.209999999999848 | 0 | 0 | 0 |
| 4.214999999999848 | 0 | 0 | 0 |
| 4.219999999999847 | 0 | 0 | 0 |
| 4.224999999999848 | 0 | 0 | 0 |
| 4.229999999999847 | 0 | 0 | 0 |
| 4.234999999999847 | 0 | 0 | 0 |
| 4.239999999999847 | 0 | 0 | 0 |
| 4.244999999999847 | 0 | 0 | 0 |
| 4.249999999999847 | 0 | 0 | 0 |
| 4.254999999999847 | 0 | 0 | 0 |
| 4.259999999999846 | 0 | 0 | 0 |
| 4.264999999999847 | 0 | 0 | 0 |
| 4.269999999999846 | 0 | 0 | 0 |
| 4.274999999999846 | 0 | 0 | 0 |
| 4.279999999999846 | 0 | 0 | 0 |
| 4.284999999999846 | 0 | 0 | 0 |
| 4.289999999999846 | 0 | 0 | 0 |
| 4.294999999999846 | 0 | 0 | 0 |
| 4.299999999999846 | 0 | 0 | 0 |
| 4.304999999999846 | 0 | 0 | 0 |
| 4.309999999999845 | 0 | 0 | 0 |
| 4.314999999999846 | 0 | 0 | 0 |
| 4.319999999999845 | 0 | 0 | 0 |
| 4.324999999999846 | 0 | 0 | 0 |
| 4.329999999999845 | 0 | 0 | 0 |
| 4.334999999999845 | 0 | 0 | 0 |
| 4.339999999999845 | 0 | 0 | 0 |
| 4.344999999999845 | 0 | 0 | 0 |
| 4.349999999999845 | 0 | 0 | 0 |
| 4.354999999999845 | 0 | 0 | 0 |
| 4.359999999999844 | 0 | 0 | 0 |
| 4.364999999999845 | 0 | 0 | 0 |
| 4.369999999999844 | 0 | 0 | 0 |
| 4.374999999999844 | 0 | 0 | 0 |
| 4.379999999999844 | 0 | 0 | 0 |
| 4.384999999999844 | 0 | 0 | 0 |
| 4.389999999999844 | 0 | 0 | 0 |
| 4.394999999999844 | 0 | 0 | 0 |
| 4.399999999999844 | 0 | 0 | 0 |
| 4.404999999999844 | 0 | 0 | 0 |
| 4.409999999999843 | 0 | 0 | 0 |
| 4.414999999999844 | 0 | 0 | 0 |
| 4.419999999999843 | 0 | 0 | 0 |
| 4.424999999999843 | 0 | 0 | 0 |
| 4.429999999999843 | 0 | 0 | 0 |
| 4.434999999999843 | 0 | 0 | 0 |
| 4.439999999999843 | 0 | 0 | 0 |
| 4.444999999999843 | 0 | 0 | 0 |
| 4.449999999999842 | 0 | 0 | 0 |
| 4.454999999999843 | 0 | 0 | 0 |
| 4.459999999999842 | 0 | 0 | 0 |
| 4.464999999999843 | 0 | 0 | 0 |
| 4.469999999999842 | 0 | 0 | 0 |
| 4.474999999999842 | 0 | 0 | 0 |
| 4.479999999999842 | 0 | 0 | 0 |
| 4.484999999999842 | 0 | 0 | 0 |
| 4.489999999999842 | 0 | 0 | 0 |
| 4.494999999999842 | 0 | 0 | 0 |
| 4.499999999999841 | 0 | 0 | 0 |
| 4.504999999999842 | 0 | 0 | 0 |
| 4.509999999999841 | 0 | 0 | 0 |
| 4.514999999999842 | 0 | 0 | 0 |
| 4.519999999999841 | 0 | 0 | 0 |
| 4.524999999999841 | 0 | 0 | 0 |
| 4.529999999999841 | 0 | 0 | 0 |
| 4.534999999999841 | 0 | 0 | 0 |
| 4.53999999999984 | 0 | 0 | 0 |
| 4.544999999999841 | 0 | 0 | 0 |
| 4.54999999999984 | 0 | 0 | 0 |
| 4.554999999999841 | 0 | 0 | 0 |
| 4.55999999999984 | 0 | 0 | 0 |
| 4.564999999999841 | 0 | 0 | 0 |
| 4.56999999999984 | 0 | 0 | 0 |
| 4.57499999999984 | 0 | 0 | 0 |
| 4.57999999999984 | 0 | 0 | 0 |
| 4.58499999999984 | 0 | 0 | 0 |
| 4.58999999999984 | 0 | 0 | 0 |
| 4.59499999999984 | 0 | 0 | 0 |
| 4.59999999999984 | 0 | 0 | 0 |
| 4.60499999999984 | 0 | 0 | 0 |
| 4.60999999999984 | 0 | 0 | 0 |
| 4.614999999999839 | 0 | 0 | 0 |
| 4.61999999999984 | 0 | 0 | 0 |
| 4.624999999999839 | 0 | 0 | 0 |
| 4.62999999999984 | 0 | 0 | 0 |
| 4.634999999999839 | 0 | 0 | 0 |
| 4.639999999999838 | 0 | 0 | 0 |
| 4.644999999999839 | 0 | 0 | 0 |
| 4.649999999999838 | 0 | 0 | 0 |
| 4.654999999999839 | 0 | 0 | 0 |
| 4.659999999999838 | 0 | 0 | 0 |
| 4.664999999999838 | 0 | 0 | 0 |
| 4.669999999999838 | 0 | 0 | 0 |
| 4.674999999999838 | 0 | 0 | 0 |
| 4.679999999999837 | 0 | 0 | 0 |
| 4.684999999999838 | 0 | 0 | 0 |
| 4.689999999999837 | 0 | 0 | 0 |
| 4.694999999999838 | 0 | 0 | 0 |
| 4.699999999999837 | 0 | 0 | 0 |
| 4.704999999999837 | 0 | 0 | 0 |
| 4.709999999999837 | 0 | 0 | 0 |
| 4.714999999999837 | 0 | 0 | 0 |
| 4.719999999999837 | 0 | 0 | 0 |
| 4.724999999999837 | 0 | 0 | 0 |
| 4.729999999999836 | 0 | 0 | 0 |
| 4.734999999999836 | 0 | 0 | 0 |
| 4.739999999999836 | 0 | 0 | 0 |
| 4.744999999999836 | 0 | 0 | 0 |
| 4.749999999999836 | 0 | 0 | 0 |
| 4.754999999999836 | 0 | 0 | 0 |
| 4.759999999999836 | 0 | 0 | 0 |
| 4.764999999999836 | 0 | 0 | 0 |
| 4.769999999999836 | 0 | 0 | 0 |
| 4.774999999999835 | 0 | 0 | 0 |
| 4.779999999999835 | 0 | 0 | 0 |
| 4.784999999999835 | 0 | 0 | 0 |
| 4.789999999999835 | 0 | 0 | 0 |
| 4.794999999999835 | 0 | 0 | 0 |
| 4.799999999999835 | 0 | 0 | 0 |
| 4.804999999999835 | 0 | 0 | 0 |
| 4.809999999999835 | 0 | 0 | 0 |
| 4.814999999999835 | 0 | 0 | 0 |
| 4.819999999999835 | 0 | 0 | 0 |
| 4.824999999999835 | 0 | 0 | 0 |
| 4.829999999999834 | 0 | 0 | 0 |
| 4.834999999999834 | 0 | 0 | 0 |
| 4.839999999999834 | 0 | 0 | 0 |
| 4.844999999999834 | 0 | 0 | 0 |
| 4.849999999999834 | 0 | 0 | 0 |
| 4.854999999999834 | 0 | 0 | 0 |
| 4.859999999999834 | 0 | 0 | 0 |
| 4.864999999999834 | 0 | 0 | 0 |
| 4.869999999999834 | 0 | 0 | 0 |
| 4.874999999999834 | 0 | 0 | 0 |
| 4.879999999999833 | 0 | 0 | 0 |
| 4.884999999999834 | 0 | 0 | 0 |
| 4.889999999999833 | 0 | 0 | 0 |
| 4.894999999999833 | 0 | 0 | 0 |
| 4.899999999999833 | 0 | 0 | 0 |
| 4.904999999999833 | 0 | 0 | 0 |
| 4.909999999999833 | 0 | 0 | 0 |
| 4.914999999999833 | 0 | 0 | 0 |
| 4.919999999999832 | 0 | 0 | 0 |
| 4.924999999999833 | 0 | 0 | 0 |
| 4.929999999999832 | 0 | 0 | 0 |
| 4.934999999999832 | 0 | 0 | 0 |
| 4.939999999999832 | 0 | 0 | 0 |
| 4.944999999999832 | 0 | 0 | 0 |
| 4.949999999999832 | 0 | 0 | 0 |
| 4.954999999999832 | 0 | 0 | 0 |
| 4.959999999999832 | 0 | 0 | 0 |
| 4.964999999999832 | 0 | 0 | 0 |
| 4.969999999999831 | 0 | 0 | 0 |
| 4.974999999999831 | 0 | 0 | 0 |
| 4.97999999999983 | 0 | 0 | 0 |
| 4.984999999999831 | 0 | 0 | 0 |
| 4.98999999999983 | 0 | 0 | 0 |
| 4.994999999999831 | 0 | 0 | 0 |
| 4.99999999999983 | 0 | 0 | 0 |